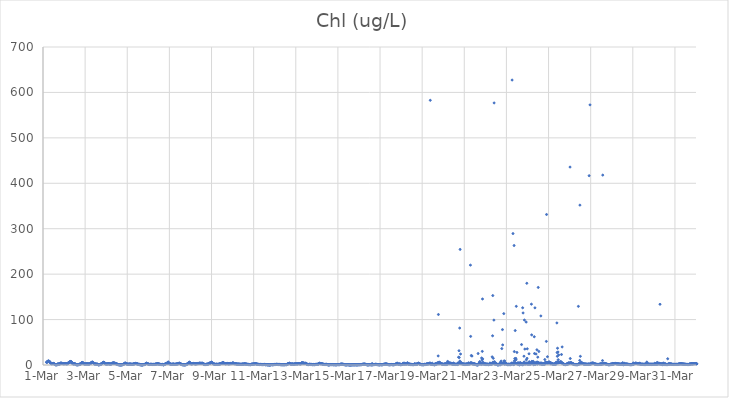
| Category | Chl (ug/L) |
|---|---|
| 44621.166666666664 | 5.81 |
| 44621.177083333336 | 6.24 |
| 44621.1875 | 6.42 |
| 44621.197916666664 | 6.61 |
| 44621.208333333336 | 7.08 |
| 44621.21875 | 6.81 |
| 44621.229166666664 | 7.43 |
| 44621.239583333336 | 8.82 |
| 44621.25 | 8.3 |
| 44621.260416666664 | 8.4 |
| 44621.270833333336 | 8.83 |
| 44621.28125 | 7.63 |
| 44621.291666666664 | 7 |
| 44621.302083333336 | 7.17 |
| 44621.3125 | 7.83 |
| 44621.322916666664 | 6.55 |
| 44621.333333333336 | 5.88 |
| 44621.34375 | 5.48 |
| 44621.354166666664 | 5.16 |
| 44621.364583333336 | 4.21 |
| 44621.375 | 3.6 |
| 44621.385416666664 | 3.33 |
| 44621.395833333336 | 2.93 |
| 44621.40625 | 2.75 |
| 44621.416666666664 | 2.92 |
| 44621.427083333336 | 2.88 |
| 44621.4375 | 2.96 |
| 44621.447916666664 | 3.06 |
| 44621.458333333336 | 2.99 |
| 44621.46875 | 3.15 |
| 44621.479166666664 | 3.33 |
| 44621.489583333336 | 3.61 |
| 44621.5 | 3.28 |
| 44621.510416666664 | 3.13 |
| 44621.520833333336 | 2.56 |
| 44621.53125 | 1.94 |
| 44621.541666666664 | 2.14 |
| 44621.552083333336 | 1.48 |
| 44621.5625 | 1.62 |
| 44621.572916666664 | 1.21 |
| 44621.583333333336 | 0.68 |
| 44621.59375 | 0.63 |
| 44621.604166666664 | 0.73 |
| 44621.614583333336 | 0.49 |
| 44621.625 | 0.66 |
| 44621.635416666664 | 0.61 |
| 44621.645833333336 | 0.64 |
| 44621.65625 | 0.63 |
| 44621.666666666664 | 0.62 |
| 44621.677083333336 | 1.18 |
| 44621.6875 | 0.76 |
| 44621.697916666664 | 1.58 |
| 44621.708333333336 | 2.42 |
| 44621.71875 | 2.84 |
| 44621.729166666664 | 1.41 |
| 44621.739583333336 | 1.57 |
| 44621.75 | 1.59 |
| 44621.760416666664 | 1.9 |
| 44621.770833333336 | 1.86 |
| 44621.78125 | 2.49 |
| 44621.791666666664 | 2.33 |
| 44621.802083333336 | 2.69 |
| 44621.8125 | 3.97 |
| 44621.822916666664 | 3.35 |
| 44621.833333333336 | 2.52 |
| 44621.84375 | 4.01 |
| 44621.854166666664 | 4.46 |
| 44621.864583333336 | 4.21 |
| 44621.875 | 3.61 |
| 44621.885416666664 | 3.43 |
| 44621.895833333336 | 3.08 |
| 44621.90625 | 3.48 |
| 44621.916666666664 | 3.33 |
| 44621.927083333336 | 3.29 |
| 44621.9375 | 3.14 |
| 44621.947916666664 | 2.68 |
| 44621.958333333336 | 2.8 |
| 44621.96875 | 2.78 |
| 44621.979166666664 | 2.89 |
| 44621.989583333336 | 2.97 |
| 44622.0 | 2.79 |
| 44622.010416666664 | 2.92 |
| 44622.020833333336 | 2.85 |
| 44622.03125 | 3.07 |
| 44622.041666666664 | 3.03 |
| 44622.052083333336 | 3.09 |
| 44622.0625 | 3.05 |
| 44622.072916666664 | 3.23 |
| 44622.083333333336 | 3.13 |
| 44622.09375 | 2.34 |
| 44622.104166666664 | 2.75 |
| 44622.114583333336 | 2.76 |
| 44622.125 | 2.82 |
| 44622.135416666664 | 2.78 |
| 44622.145833333336 | 2.82 |
| 44622.15625 | 3.04 |
| 44622.166666666664 | 2.64 |
| 44622.177083333336 | 3.23 |
| 44622.1875 | 4.03 |
| 44622.197916666664 | 4.55 |
| 44622.208333333336 | 4.52 |
| 44622.21875 | 5.01 |
| 44622.229166666664 | 5.44 |
| 44622.239583333336 | 5.59 |
| 44622.25 | 5.75 |
| 44622.260416666664 | 6.1 |
| 44622.270833333336 | 6.4 |
| 44622.28125 | 7.26 |
| 44622.291666666664 | 7.83 |
| 44622.302083333336 | 6.17 |
| 44622.3125 | 7.11 |
| 44622.322916666664 | 7.71 |
| 44622.333333333336 | 6.86 |
| 44622.34375 | 7.07 |
| 44622.354166666664 | 6.28 |
| 44622.364583333336 | 5.53 |
| 44622.375 | 4.74 |
| 44622.385416666664 | 4.25 |
| 44622.395833333336 | 3.78 |
| 44622.40625 | 3.33 |
| 44622.416666666664 | 2.85 |
| 44622.427083333336 | 2.57 |
| 44622.4375 | 2.44 |
| 44622.447916666664 | 2.35 |
| 44622.458333333336 | 2.58 |
| 44622.46875 | 2.59 |
| 44622.479166666664 | 2.75 |
| 44622.489583333336 | 3.01 |
| 44622.5 | 2.68 |
| 44622.510416666664 | 2.52 |
| 44622.520833333336 | 2.45 |
| 44622.53125 | 2.06 |
| 44622.541666666664 | 1.64 |
| 44622.552083333336 | 1.15 |
| 44622.5625 | 0.98 |
| 44622.572916666664 | 1.21 |
| 44622.583333333336 | 0.62 |
| 44622.59375 | 0.6 |
| 44622.604166666664 | 0.79 |
| 44622.614583333336 | 0.69 |
| 44622.625 | 0.46 |
| 44622.635416666664 | 0.48 |
| 44622.645833333336 | 0.63 |
| 44622.65625 | 0.79 |
| 44622.666666666664 | 0.52 |
| 44622.677083333336 | 0.69 |
| 44622.6875 | 1 |
| 44622.697916666664 | 1.22 |
| 44622.708333333336 | 1.14 |
| 44622.71875 | 1.1 |
| 44622.729166666664 | 1.03 |
| 44622.739583333336 | 1.37 |
| 44622.75 | 1.47 |
| 44622.760416666664 | 2.26 |
| 44622.770833333336 | 3.09 |
| 44622.78125 | 1.83 |
| 44622.791666666664 | 1.88 |
| 44622.802083333336 | 2.87 |
| 44622.8125 | 3.79 |
| 44622.822916666664 | 4.49 |
| 44622.833333333336 | 4.03 |
| 44622.84375 | 4.75 |
| 44622.854166666664 | 5.35 |
| 44622.864583333336 | 5.64 |
| 44622.875 | 5.38 |
| 44622.885416666664 | 5.11 |
| 44622.895833333336 | 4.59 |
| 44622.90625 | 4.03 |
| 44622.916666666664 | 3.62 |
| 44622.927083333336 | 3.26 |
| 44622.9375 | 2.79 |
| 44622.947916666664 | 2.58 |
| 44622.958333333336 | 2.47 |
| 44622.96875 | 2.43 |
| 44622.979166666664 | 2.33 |
| 44622.989583333336 | 2.28 |
| 44623.0 | 2.36 |
| 44623.010416666664 | 2.46 |
| 44623.020833333336 | 2.27 |
| 44623.03125 | 2.34 |
| 44623.041666666664 | 2.33 |
| 44623.052083333336 | 2.34 |
| 44623.0625 | 2.4 |
| 44623.072916666664 | 2.49 |
| 44623.083333333336 | 2.42 |
| 44623.09375 | 2.65 |
| 44623.104166666664 | 2.42 |
| 44623.114583333336 | 2.25 |
| 44623.125 | 2.3 |
| 44623.135416666664 | 2.32 |
| 44623.145833333336 | 2.13 |
| 44623.15625 | 2.24 |
| 44623.166666666664 | 2.19 |
| 44623.177083333336 | 2.09 |
| 44623.1875 | 2.29 |
| 44623.197916666664 | 2.48 |
| 44623.208333333336 | 2.39 |
| 44623.21875 | 2.53 |
| 44623.229166666664 | 2.73 |
| 44623.239583333336 | 3.16 |
| 44623.25 | 3.58 |
| 44623.260416666664 | 3.85 |
| 44623.270833333336 | 4.09 |
| 44623.28125 | 4.4 |
| 44623.291666666664 | 4.84 |
| 44623.302083333336 | 5.17 |
| 44623.3125 | 5.11 |
| 44623.322916666664 | 6.08 |
| 44623.333333333336 | 6.38 |
| 44623.34375 | 5.94 |
| 44623.354166666664 | 6.04 |
| 44623.364583333336 | 5.82 |
| 44623.375 | 5.26 |
| 44623.385416666664 | 4.86 |
| 44623.395833333336 | 4.46 |
| 44623.40625 | 4.06 |
| 44623.416666666664 | 3.45 |
| 44623.427083333336 | 3.35 |
| 44623.4375 | 2.81 |
| 44623.447916666664 | 2.37 |
| 44623.458333333336 | 2.04 |
| 44623.46875 | 2.04 |
| 44623.479166666664 | 2.17 |
| 44623.489583333336 | 2.2 |
| 44623.5 | 2.16 |
| 44623.510416666664 | 2.24 |
| 44623.520833333336 | 2.11 |
| 44623.53125 | 1.88 |
| 44623.541666666664 | 1.35 |
| 44623.552083333336 | 1.53 |
| 44623.5625 | 1.77 |
| 44623.572916666664 | 1.83 |
| 44623.583333333336 | 1.76 |
| 44623.59375 | 1.43 |
| 44623.604166666664 | 1.14 |
| 44623.614583333336 | 0.54 |
| 44623.625 | 0.62 |
| 44623.635416666664 | 0.56 |
| 44623.645833333336 | 0.56 |
| 44623.65625 | 0.55 |
| 44623.666666666664 | 0.71 |
| 44623.677083333336 | 0.72 |
| 44623.6875 | 0.89 |
| 44623.697916666664 | 0.82 |
| 44623.708333333336 | 1.09 |
| 44623.71875 | 1.02 |
| 44623.729166666664 | 1.81 |
| 44623.739583333336 | 1.55 |
| 44623.75 | 1.52 |
| 44623.760416666664 | 2.25 |
| 44623.770833333336 | 2.27 |
| 44623.78125 | 2.52 |
| 44623.791666666664 | 3.14 |
| 44623.802083333336 | 3.49 |
| 44623.8125 | 3.98 |
| 44623.822916666664 | 4.35 |
| 44623.833333333336 | 4.85 |
| 44623.84375 | 4.59 |
| 44623.854166666664 | 4.9 |
| 44623.864583333336 | 5 |
| 44623.875 | 5.66 |
| 44623.885416666664 | 6.25 |
| 44623.895833333336 | 5.83 |
| 44623.90625 | 5.19 |
| 44623.916666666664 | 4.59 |
| 44623.927083333336 | 4.33 |
| 44623.9375 | 3.58 |
| 44623.947916666664 | 3.2 |
| 44623.958333333336 | 3.14 |
| 44623.96875 | 2.48 |
| 44623.979166666664 | 2.46 |
| 44623.989583333336 | 2.35 |
| 44624.0 | 2.19 |
| 44624.010416666664 | 2.34 |
| 44624.020833333336 | 2.21 |
| 44624.03125 | 2.2 |
| 44624.041666666664 | 2.26 |
| 44624.052083333336 | 2.44 |
| 44624.0625 | 2.36 |
| 44624.072916666664 | 2.7 |
| 44624.083333333336 | 2.73 |
| 44624.09375 | 2.67 |
| 44624.104166666664 | 2.78 |
| 44624.114583333336 | 2.67 |
| 44624.125 | 2.64 |
| 44624.135416666664 | 2.63 |
| 44624.145833333336 | 2.43 |
| 44624.15625 | 2.37 |
| 44624.166666666664 | 2.16 |
| 44624.177083333336 | 2.09 |
| 44624.1875 | 2.18 |
| 44624.197916666664 | 2.15 |
| 44624.208333333336 | 2.1 |
| 44624.21875 | 2.17 |
| 44624.229166666664 | 1.98 |
| 44624.239583333336 | 2.2 |
| 44624.25 | 2.61 |
| 44624.260416666664 | 3.22 |
| 44624.270833333336 | 3.53 |
| 44624.28125 | 4.03 |
| 44624.291666666664 | 3.77 |
| 44624.302083333336 | 4.04 |
| 44624.3125 | 4.15 |
| 44624.322916666664 | 4.02 |
| 44624.333333333336 | 4.15 |
| 44624.34375 | 3.89 |
| 44624.354166666664 | 4.82 |
| 44624.364583333336 | 4.69 |
| 44624.375 | 4.1 |
| 44624.385416666664 | 4.14 |
| 44624.395833333336 | 3.59 |
| 44624.40625 | 3.84 |
| 44624.416666666664 | 3.69 |
| 44624.427083333336 | 3.7 |
| 44624.4375 | 3.42 |
| 44624.447916666664 | 3.02 |
| 44624.458333333336 | 2.74 |
| 44624.46875 | 2.54 |
| 44624.479166666664 | 2.6 |
| 44624.489583333336 | 2.45 |
| 44624.5 | 2.46 |
| 44624.510416666664 | 2 |
| 44624.520833333336 | 2.02 |
| 44624.53125 | 1.47 |
| 44624.541666666664 | 1.03 |
| 44624.552083333336 | 0.97 |
| 44624.5625 | 0.92 |
| 44624.572916666664 | 0.81 |
| 44624.583333333336 | 0.79 |
| 44624.59375 | 0.68 |
| 44624.604166666664 | 0.7 |
| 44624.614583333336 | 0.55 |
| 44624.625 | 0.43 |
| 44624.635416666664 | 0.52 |
| 44624.645833333336 | 0.65 |
| 44624.65625 | 0.4 |
| 44624.666666666664 | 0.37 |
| 44624.677083333336 | 0.44 |
| 44624.6875 | 0.42 |
| 44624.697916666664 | 0.3 |
| 44624.708333333336 | 0.35 |
| 44624.71875 | 0.27 |
| 44624.729166666664 | 0.48 |
| 44624.739583333336 | 0.75 |
| 44624.75 | 0.72 |
| 44624.760416666664 | 0.88 |
| 44624.770833333336 | 0.67 |
| 44624.78125 | 0.69 |
| 44624.791666666664 | 1.04 |
| 44624.802083333336 | 1.13 |
| 44624.8125 | 1.26 |
| 44624.822916666664 | 1.76 |
| 44624.833333333336 | 1.79 |
| 44624.84375 | 2 |
| 44624.854166666664 | 2.44 |
| 44624.864583333336 | 2.82 |
| 44624.875 | 3.76 |
| 44624.885416666664 | 3.87 |
| 44624.895833333336 | 3.85 |
| 44624.90625 | 3.91 |
| 44624.916666666664 | 3.95 |
| 44624.927083333336 | 3.74 |
| 44624.9375 | 3.51 |
| 44624.947916666664 | 3.38 |
| 44624.958333333336 | 2.75 |
| 44624.96875 | 2.42 |
| 44624.979166666664 | 2.34 |
| 44624.989583333336 | 2.21 |
| 44625.0 | 1.98 |
| 44625.010416666664 | 1.67 |
| 44625.020833333336 | 1.71 |
| 44625.03125 | 1.51 |
| 44625.041666666664 | 1.43 |
| 44625.052083333336 | 1.71 |
| 44625.0625 | 1.72 |
| 44625.072916666664 | 1.66 |
| 44625.083333333336 | 1.94 |
| 44625.09375 | 1.74 |
| 44625.104166666664 | 1.99 |
| 44625.114583333336 | 1.89 |
| 44625.125 | 2.24 |
| 44625.135416666664 | 1.87 |
| 44625.145833333336 | 1.87 |
| 44625.15625 | 1.98 |
| 44625.166666666664 | 1.7 |
| 44625.177083333336 | 1.65 |
| 44625.1875 | 1.62 |
| 44625.197916666664 | 1.6 |
| 44625.208333333336 | 1.59 |
| 44625.21875 | 1.54 |
| 44625.229166666664 | 1.42 |
| 44625.239583333336 | 1.35 |
| 44625.25 | 1.47 |
| 44625.260416666664 | 1.58 |
| 44625.270833333336 | 1.88 |
| 44625.28125 | 1.96 |
| 44625.291666666664 | 2.15 |
| 44625.302083333336 | 2.35 |
| 44625.3125 | 2.33 |
| 44625.322916666664 | 2.52 |
| 44625.333333333336 | 2.75 |
| 44625.34375 | 2.8 |
| 44625.354166666664 | 2.53 |
| 44625.364583333336 | 2.89 |
| 44625.375 | 3.19 |
| 44625.385416666664 | 3.59 |
| 44625.395833333336 | 3.22 |
| 44625.40625 | 3.52 |
| 44625.416666666664 | 3.09 |
| 44625.427083333336 | 3.26 |
| 44625.4375 | 2.93 |
| 44625.447916666664 | 2.95 |
| 44625.458333333336 | 2.59 |
| 44625.46875 | 2.47 |
| 44625.479166666664 | 2.32 |
| 44625.489583333336 | 2.27 |
| 44625.5 | 1.9 |
| 44625.510416666664 | 1.7 |
| 44625.520833333336 | 1.57 |
| 44625.53125 | 1.42 |
| 44625.541666666664 | 1.37 |
| 44625.552083333336 | 1.33 |
| 44625.5625 | 1.3 |
| 44625.572916666664 | 1.44 |
| 44625.583333333336 | 1.35 |
| 44625.59375 | 0.72 |
| 44625.604166666664 | 0.47 |
| 44625.614583333336 | 0.56 |
| 44625.625 | 0.58 |
| 44625.635416666664 | 0.71 |
| 44625.645833333336 | 1.03 |
| 44625.65625 | 0.49 |
| 44625.666666666664 | 0.41 |
| 44625.677083333336 | 0.46 |
| 44625.6875 | 0.35 |
| 44625.697916666664 | 0.31 |
| 44625.708333333336 | 0.34 |
| 44625.71875 | 0.3 |
| 44625.729166666664 | 0.42 |
| 44625.739583333336 | 0.48 |
| 44625.75 | 0.79 |
| 44625.760416666664 | 0.74 |
| 44625.770833333336 | 0.85 |
| 44625.78125 | 0.88 |
| 44625.791666666664 | 0.93 |
| 44625.802083333336 | 0.79 |
| 44625.8125 | 0.97 |
| 44625.822916666664 | 1.09 |
| 44625.833333333336 | 1.21 |
| 44625.84375 | 1.66 |
| 44625.854166666664 | 2.05 |
| 44625.864583333336 | 2.64 |
| 44625.875 | 2.29 |
| 44625.885416666664 | 2.74 |
| 44625.895833333336 | 3.21 |
| 44625.90625 | 4.07 |
| 44625.916666666664 | 3.71 |
| 44625.927083333336 | 3.61 |
| 44625.9375 | 3.37 |
| 44625.947916666664 | 2.98 |
| 44625.958333333336 | 3.07 |
| 44625.96875 | 2.9 |
| 44625.979166666664 | 2.57 |
| 44625.989583333336 | 2.2 |
| 44626.0 | 1.88 |
| 44626.010416666664 | 1.59 |
| 44626.020833333336 | 1.52 |
| 44626.03125 | 1.37 |
| 44626.041666666664 | 1.24 |
| 44626.052083333336 | 1.22 |
| 44626.0625 | 1.11 |
| 44626.072916666664 | 1.35 |
| 44626.083333333336 | 1.43 |
| 44626.09375 | 1.47 |
| 44626.104166666664 | 1.42 |
| 44626.114583333336 | 1.43 |
| 44626.125 | 1.48 |
| 44626.135416666664 | 1.38 |
| 44626.145833333336 | 1.35 |
| 44626.15625 | 1.48 |
| 44626.166666666664 | 1.41 |
| 44626.177083333336 | 1.26 |
| 44626.1875 | 1.23 |
| 44626.197916666664 | 1.16 |
| 44626.208333333336 | 1.26 |
| 44626.21875 | 1.2 |
| 44626.229166666664 | 1.46 |
| 44626.239583333336 | 1.31 |
| 44626.25 | 1.25 |
| 44626.260416666664 | 1.21 |
| 44626.270833333336 | 1.23 |
| 44626.28125 | 1.17 |
| 44626.291666666664 | 1.21 |
| 44626.302083333336 | 1.24 |
| 44626.3125 | 1.58 |
| 44626.322916666664 | 1.63 |
| 44626.333333333336 | 1.7 |
| 44626.34375 | 1.84 |
| 44626.354166666664 | 1.88 |
| 44626.364583333336 | 2.03 |
| 44626.375 | 2.02 |
| 44626.385416666664 | 2.23 |
| 44626.395833333336 | 2.3 |
| 44626.40625 | 2.21 |
| 44626.416666666664 | 2.49 |
| 44626.427083333336 | 2.57 |
| 44626.4375 | 2.99 |
| 44626.447916666664 | 2.57 |
| 44626.458333333336 | 2.54 |
| 44626.46875 | 2.39 |
| 44626.479166666664 | 2.47 |
| 44626.489583333336 | 2.15 |
| 44626.5 | 2.05 |
| 44626.510416666664 | 1.82 |
| 44626.520833333336 | 1.74 |
| 44626.53125 | 1.77 |
| 44626.541666666664 | 1.57 |
| 44626.552083333336 | 1.39 |
| 44626.5625 | 1.22 |
| 44626.572916666664 | 1.24 |
| 44626.583333333336 | 1.2 |
| 44626.59375 | 1.14 |
| 44626.604166666664 | 0.93 |
| 44626.614583333336 | 1.05 |
| 44626.625 | 1.07 |
| 44626.635416666664 | 1.13 |
| 44626.645833333336 | 0.69 |
| 44626.65625 | 1.02 |
| 44626.666666666664 | 0.93 |
| 44626.677083333336 | 1.46 |
| 44626.6875 | 1.1 |
| 44626.697916666664 | 0.83 |
| 44626.708333333336 | 0.5 |
| 44626.71875 | 0.43 |
| 44626.729166666664 | 0.63 |
| 44626.739583333336 | 0.79 |
| 44626.75 | 1.14 |
| 44626.760416666664 | 1.2 |
| 44626.770833333336 | 1.07 |
| 44626.78125 | 1.06 |
| 44626.791666666664 | 1.74 |
| 44626.802083333336 | 2.44 |
| 44626.8125 | 2.74 |
| 44626.822916666664 | 3.04 |
| 44626.833333333336 | 3.14 |
| 44626.84375 | 3.13 |
| 44626.854166666664 | 3.09 |
| 44626.864583333336 | 3.54 |
| 44626.875 | 3.57 |
| 44626.885416666664 | 3.85 |
| 44626.895833333336 | 4.06 |
| 44626.90625 | 3.91 |
| 44626.916666666664 | 4.82 |
| 44626.927083333336 | 5.33 |
| 44626.9375 | 4.83 |
| 44626.947916666664 | 6.79 |
| 44626.958333333336 | 4.81 |
| 44626.96875 | 4.07 |
| 44626.979166666664 | 3.83 |
| 44626.989583333336 | 3.66 |
| 44627.0 | 3.49 |
| 44627.010416666664 | 3.05 |
| 44627.020833333336 | 2.44 |
| 44627.03125 | 2.26 |
| 44627.041666666664 | 2.17 |
| 44627.052083333336 | 1.93 |
| 44627.0625 | 1.73 |
| 44627.072916666664 | 1.51 |
| 44627.083333333336 | 1.58 |
| 44627.09375 | 1.35 |
| 44627.104166666664 | 1.55 |
| 44627.114583333336 | 1.54 |
| 44627.125 | 1.49 |
| 44627.135416666664 | 1.6 |
| 44627.145833333336 | 1.65 |
| 44627.15625 | 1.79 |
| 44627.166666666664 | 1.9 |
| 44627.177083333336 | 1.98 |
| 44627.1875 | 1.84 |
| 44627.197916666664 | 2.05 |
| 44627.208333333336 | 1.82 |
| 44627.21875 | 1.7 |
| 44627.229166666664 | 1.4 |
| 44627.239583333336 | 1.35 |
| 44627.25 | 1.45 |
| 44627.260416666664 | 1.64 |
| 44627.270833333336 | 1.58 |
| 44627.28125 | 1.56 |
| 44627.291666666664 | 1.5 |
| 44627.302083333336 | 1.68 |
| 44627.3125 | 1.79 |
| 44627.322916666664 | 1.96 |
| 44627.333333333336 | 2.13 |
| 44627.34375 | 2.2 |
| 44627.354166666664 | 2.29 |
| 44627.364583333336 | 2.27 |
| 44627.375 | 2.33 |
| 44627.385416666664 | 2.31 |
| 44627.395833333336 | 2.58 |
| 44627.40625 | 2.5 |
| 44627.416666666664 | 3 |
| 44627.427083333336 | 2.89 |
| 44627.4375 | 3.13 |
| 44627.447916666664 | 3.36 |
| 44627.458333333336 | 3.48 |
| 44627.46875 | 4.36 |
| 44627.479166666664 | 3.59 |
| 44627.489583333336 | 3.2 |
| 44627.5 | 2.96 |
| 44627.510416666664 | 2.71 |
| 44627.520833333336 | 2.68 |
| 44627.53125 | 2.65 |
| 44627.541666666664 | 2.22 |
| 44627.552083333336 | 2 |
| 44627.5625 | 1.39 |
| 44627.572916666664 | 1.59 |
| 44627.583333333336 | 1.02 |
| 44627.59375 | 0.86 |
| 44627.604166666664 | 0.67 |
| 44627.614583333336 | 0.67 |
| 44627.625 | 0.81 |
| 44627.635416666664 | 0.68 |
| 44627.645833333336 | 0.55 |
| 44627.65625 | 0.73 |
| 44627.666666666664 | 0.64 |
| 44627.677083333336 | 0.41 |
| 44627.6875 | 0.49 |
| 44627.697916666664 | 0.4 |
| 44627.708333333336 | 0.39 |
| 44627.71875 | 0.39 |
| 44627.729166666664 | 0.46 |
| 44627.739583333336 | 0.85 |
| 44627.75 | 0.59 |
| 44627.760416666664 | 0.4 |
| 44627.770833333336 | 0.71 |
| 44627.78125 | 0.66 |
| 44627.791666666664 | 0.98 |
| 44627.802083333336 | 1.36 |
| 44627.8125 | 0.92 |
| 44627.822916666664 | 1.28 |
| 44627.833333333336 | 1.48 |
| 44627.84375 | 2.01 |
| 44627.854166666664 | 2.52 |
| 44627.864583333336 | 3.11 |
| 44627.875 | 3.51 |
| 44627.885416666664 | 3.87 |
| 44627.895833333336 | 3.95 |
| 44627.90625 | 4.07 |
| 44627.916666666664 | 4.31 |
| 44627.927083333336 | 4.61 |
| 44627.9375 | 4.64 |
| 44627.947916666664 | 6.43 |
| 44627.958333333336 | 5.17 |
| 44627.96875 | 5.81 |
| 44627.979166666664 | 4.61 |
| 44627.989583333336 | 3.34 |
| 44628.0 | 2.92 |
| 44628.010416666664 | 3.1 |
| 44628.020833333336 | 3.05 |
| 44628.03125 | 2.51 |
| 44628.041666666664 | 2.33 |
| 44628.052083333336 | 2.38 |
| 44628.0625 | 2.64 |
| 44628.072916666664 | 3.03 |
| 44628.083333333336 | 2.94 |
| 44628.09375 | 2.58 |
| 44628.104166666664 | 2.85 |
| 44628.114583333336 | 2.97 |
| 44628.125 | 3.4 |
| 44628.135416666664 | 3.34 |
| 44628.145833333336 | 3.4 |
| 44628.15625 | 3.2 |
| 44628.166666666664 | 2.97 |
| 44628.177083333336 | 2.89 |
| 44628.1875 | 2.74 |
| 44628.197916666664 | 2.87 |
| 44628.208333333336 | 3.12 |
| 44628.21875 | 2.84 |
| 44628.229166666664 | 2.34 |
| 44628.239583333336 | 2.45 |
| 44628.25 | 2.44 |
| 44628.260416666664 | 2.38 |
| 44628.270833333336 | 2.39 |
| 44628.28125 | 2.76 |
| 44628.291666666664 | 2.9 |
| 44628.302083333336 | 3.18 |
| 44628.3125 | 3.12 |
| 44628.322916666664 | 3.36 |
| 44628.333333333336 | 3 |
| 44628.34375 | 2.93 |
| 44628.354166666664 | 3.1 |
| 44628.364583333336 | 3.01 |
| 44628.375 | 3.23 |
| 44628.385416666664 | 3.39 |
| 44628.395833333336 | 3.47 |
| 44628.40625 | 3.59 |
| 44628.416666666664 | 3.53 |
| 44628.427083333336 | 3.57 |
| 44628.4375 | 4.02 |
| 44628.447916666664 | 4.1 |
| 44628.458333333336 | 3.76 |
| 44628.46875 | 3.66 |
| 44628.479166666664 | 3.55 |
| 44628.489583333336 | 3.54 |
| 44628.5 | 3.49 |
| 44628.510416666664 | 3.39 |
| 44628.520833333336 | 3.67 |
| 44628.53125 | 3.53 |
| 44628.541666666664 | 3.66 |
| 44628.552083333336 | 3.96 |
| 44628.5625 | 3.85 |
| 44628.572916666664 | 3.54 |
| 44628.583333333336 | 3.28 |
| 44628.59375 | 2.77 |
| 44628.604166666664 | 2.77 |
| 44628.614583333336 | 2.45 |
| 44628.625 | 1.69 |
| 44628.635416666664 | 1.89 |
| 44628.645833333336 | 1.33 |
| 44628.65625 | 1.85 |
| 44628.666666666664 | 1.33 |
| 44628.677083333336 | 1.1 |
| 44628.6875 | 0.89 |
| 44628.697916666664 | 1.37 |
| 44628.708333333336 | 0.97 |
| 44628.71875 | 1.16 |
| 44628.729166666664 | 0.98 |
| 44628.739583333336 | 1.24 |
| 44628.75 | 1.12 |
| 44628.760416666664 | 1.84 |
| 44628.770833333336 | 1.39 |
| 44628.78125 | 1.64 |
| 44628.791666666664 | 1.53 |
| 44628.802083333336 | 1.65 |
| 44628.8125 | 1.69 |
| 44628.822916666664 | 1.73 |
| 44628.833333333336 | 2.04 |
| 44628.84375 | 2.12 |
| 44628.854166666664 | 2.49 |
| 44628.864583333336 | 3.18 |
| 44628.875 | 3.64 |
| 44628.885416666664 | 3.78 |
| 44628.895833333336 | 3.86 |
| 44628.90625 | 3.74 |
| 44628.916666666664 | 4.04 |
| 44628.927083333336 | 3.98 |
| 44628.9375 | 4.05 |
| 44628.947916666664 | 4.23 |
| 44628.958333333336 | 4.62 |
| 44628.96875 | 4.58 |
| 44628.979166666664 | 5.04 |
| 44628.989583333336 | 5.96 |
| 44629.0 | 6.17 |
| 44629.010416666664 | 5.56 |
| 44629.020833333336 | 5.34 |
| 44629.03125 | 5.49 |
| 44629.041666666664 | 4.76 |
| 44629.052083333336 | 3.86 |
| 44629.0625 | 3.14 |
| 44629.072916666664 | 3.42 |
| 44629.083333333336 | 2.97 |
| 44629.09375 | 2.74 |
| 44629.104166666664 | 2.41 |
| 44629.114583333336 | 2.2 |
| 44629.125 | 2.18 |
| 44629.135416666664 | 1.84 |
| 44629.145833333336 | 1.68 |
| 44629.15625 | 1.46 |
| 44629.166666666664 | 1.41 |
| 44629.177083333336 | 1.31 |
| 44629.1875 | 1.41 |
| 44629.197916666664 | 1.38 |
| 44629.208333333336 | 1.22 |
| 44629.21875 | 1.35 |
| 44629.229166666664 | 1.48 |
| 44629.239583333336 | 1.53 |
| 44629.25 | 1.76 |
| 44629.260416666664 | 1.72 |
| 44629.270833333336 | 1.37 |
| 44629.28125 | 1.38 |
| 44629.291666666664 | 1.34 |
| 44629.302083333336 | 1.17 |
| 44629.3125 | 1.49 |
| 44629.322916666664 | 1.25 |
| 44629.333333333336 | 1.43 |
| 44629.34375 | 1.58 |
| 44629.354166666664 | 1.95 |
| 44629.364583333336 | 2.16 |
| 44629.375 | 2.2 |
| 44629.385416666664 | 2.33 |
| 44629.395833333336 | 2.26 |
| 44629.40625 | 2.42 |
| 44629.416666666664 | 2.62 |
| 44629.427083333336 | 2.82 |
| 44629.4375 | 3.04 |
| 44629.447916666664 | 3.14 |
| 44629.458333333336 | 3.49 |
| 44629.46875 | 3.57 |
| 44629.479166666664 | 3.81 |
| 44629.489583333336 | 3.57 |
| 44629.5 | 3.82 |
| 44629.510416666664 | 4.12 |
| 44629.520833333336 | 4.18 |
| 44629.53125 | 4.33 |
| 44629.541666666664 | 5.57 |
| 44629.552083333336 | 5.23 |
| 44629.5625 | 4.61 |
| 44629.572916666664 | 4.58 |
| 44629.583333333336 | 3.94 |
| 44629.59375 | 3.67 |
| 44629.604166666664 | 3.63 |
| 44629.614583333336 | 3.54 |
| 44629.625 | 3.2 |
| 44629.635416666664 | 3.14 |
| 44629.645833333336 | 2.87 |
| 44629.65625 | 3.01 |
| 44629.666666666664 | 2.72 |
| 44629.677083333336 | 2.54 |
| 44629.6875 | 2.69 |
| 44629.697916666664 | 2.82 |
| 44629.708333333336 | 3.12 |
| 44629.71875 | 3.21 |
| 44629.729166666664 | 3.14 |
| 44629.739583333336 | 3.23 |
| 44629.75 | 2.87 |
| 44629.760416666664 | 3.44 |
| 44629.770833333336 | 3.22 |
| 44629.78125 | 2.53 |
| 44629.791666666664 | 2.65 |
| 44629.802083333336 | 2.85 |
| 44629.8125 | 2.57 |
| 44629.822916666664 | 2.75 |
| 44629.833333333336 | 2.62 |
| 44629.84375 | 3.13 |
| 44629.854166666664 | 2.81 |
| 44629.864583333336 | 2.71 |
| 44629.875 | 2.71 |
| 44629.885416666664 | 2.82 |
| 44629.895833333336 | 3.5 |
| 44629.90625 | 2.95 |
| 44629.916666666664 | 3.32 |
| 44629.927083333336 | 3.05 |
| 44629.9375 | 3.04 |
| 44629.947916666664 | 3.27 |
| 44629.958333333336 | 3.12 |
| 44629.96875 | 3.59 |
| 44629.979166666664 | 3.98 |
| 44629.989583333336 | 3.85 |
| 44630.0 | 4.35 |
| 44630.010416666664 | 4.01 |
| 44630.020833333336 | 4.14 |
| 44630.03125 | 4.23 |
| 44630.041666666664 | 4.19 |
| 44630.052083333336 | 3.29 |
| 44630.0625 | 3.78 |
| 44630.072916666664 | 3.18 |
| 44630.083333333336 | 3.27 |
| 44630.09375 | 2.76 |
| 44630.104166666664 | 2.83 |
| 44630.114583333336 | 2.85 |
| 44630.125 | 3.03 |
| 44630.135416666664 | 2.93 |
| 44630.145833333336 | 2.71 |
| 44630.15625 | 2.76 |
| 44630.166666666664 | 2.6 |
| 44630.177083333336 | 2.33 |
| 44630.1875 | 2.42 |
| 44630.197916666664 | 2.05 |
| 44630.208333333336 | 1.83 |
| 44630.21875 | 1.84 |
| 44630.229166666664 | 1.93 |
| 44630.239583333336 | 1.85 |
| 44630.25 | 1.91 |
| 44630.260416666664 | 1.84 |
| 44630.270833333336 | 1.72 |
| 44630.28125 | 1.94 |
| 44630.291666666664 | 1.86 |
| 44630.302083333336 | 1.83 |
| 44630.3125 | 1.76 |
| 44630.322916666664 | 1.7 |
| 44630.333333333336 | 1.6 |
| 44630.34375 | 1.7 |
| 44630.354166666664 | 1.55 |
| 44630.364583333336 | 1.54 |
| 44630.375 | 1.48 |
| 44630.385416666664 | 1.52 |
| 44630.395833333336 | 1.45 |
| 44630.40625 | 1.34 |
| 44630.416666666664 | 1.44 |
| 44630.427083333336 | 1.55 |
| 44630.4375 | 1.6 |
| 44630.447916666664 | 1.68 |
| 44630.458333333336 | 2 |
| 44630.46875 | 2.05 |
| 44630.479166666664 | 1.97 |
| 44630.489583333336 | 1.71 |
| 44630.5 | 1.86 |
| 44630.510416666664 | 1.85 |
| 44630.520833333336 | 1.84 |
| 44630.53125 | 1.94 |
| 44630.541666666664 | 2.15 |
| 44630.552083333336 | 2.33 |
| 44630.5625 | 2.57 |
| 44630.572916666664 | 2.82 |
| 44630.583333333336 | 2.55 |
| 44630.59375 | 2.33 |
| 44630.604166666664 | 2.16 |
| 44630.614583333336 | 2.09 |
| 44630.625 | 2.08 |
| 44630.635416666664 | 1.89 |
| 44630.645833333336 | 1.99 |
| 44630.65625 | 1.83 |
| 44630.666666666664 | 1.8 |
| 44630.677083333336 | 1.64 |
| 44630.6875 | 1.58 |
| 44630.697916666664 | 1.3 |
| 44630.708333333336 | 1.34 |
| 44630.71875 | 1.51 |
| 44630.729166666664 | 1.57 |
| 44630.739583333336 | 1.44 |
| 44630.75 | 1.45 |
| 44630.760416666664 | 1 |
| 44630.770833333336 | 0.73 |
| 44630.78125 | 0.75 |
| 44630.791666666664 | 0.88 |
| 44630.802083333336 | 1.04 |
| 44630.8125 | 1.1 |
| 44630.822916666664 | 0.93 |
| 44630.833333333336 | 0.96 |
| 44630.84375 | 0.62 |
| 44630.854166666664 | 1.08 |
| 44630.864583333336 | 0.91 |
| 44630.875 | 1.43 |
| 44630.885416666664 | 1.48 |
| 44630.895833333336 | 1.75 |
| 44630.90625 | 1.52 |
| 44630.916666666664 | 1.65 |
| 44630.927083333336 | 1.78 |
| 44630.9375 | 1.82 |
| 44630.947916666664 | 1.85 |
| 44630.958333333336 | 1.98 |
| 44630.96875 | 1.95 |
| 44630.979166666664 | 2.04 |
| 44630.989583333336 | 2.28 |
| 44631.0 | 2.15 |
| 44631.010416666664 | 2.14 |
| 44631.020833333336 | 2.24 |
| 44631.03125 | 2.4 |
| 44631.041666666664 | 2.47 |
| 44631.052083333336 | 2.61 |
| 44631.0625 | 2.69 |
| 44631.072916666664 | 3.09 |
| 44631.083333333336 | 2.95 |
| 44631.09375 | 2.78 |
| 44631.104166666664 | 2.92 |
| 44631.114583333336 | 2.6 |
| 44631.125 | 2.25 |
| 44631.135416666664 | 2.15 |
| 44631.145833333336 | 2.03 |
| 44631.15625 | 1.92 |
| 44631.166666666664 | 1.55 |
| 44631.177083333336 | 1.55 |
| 44631.1875 | 1.69 |
| 44631.197916666664 | 1.65 |
| 44631.208333333336 | 1.45 |
| 44631.21875 | 1.41 |
| 44631.229166666664 | 1.37 |
| 44631.239583333336 | 1.29 |
| 44631.25 | 1.33 |
| 44631.260416666664 | 1.26 |
| 44631.270833333336 | 1.16 |
| 44631.28125 | 1 |
| 44631.291666666664 | 1.15 |
| 44631.302083333336 | 1.19 |
| 44631.3125 | 1.31 |
| 44631.322916666664 | 1.26 |
| 44631.333333333336 | 1.22 |
| 44631.34375 | 1.13 |
| 44631.354166666664 | 1.02 |
| 44631.364583333336 | 0.99 |
| 44631.375 | 1.13 |
| 44631.385416666664 | 1.01 |
| 44631.395833333336 | 1.06 |
| 44631.40625 | 1.07 |
| 44631.416666666664 | 0.95 |
| 44631.427083333336 | 0.9 |
| 44631.4375 | 0.99 |
| 44631.447916666664 | 0.88 |
| 44631.458333333336 | 0.99 |
| 44631.46875 | 1.06 |
| 44631.479166666664 | 0.99 |
| 44631.489583333336 | 1.18 |
| 44631.5 | 1.29 |
| 44631.510416666664 | 1.27 |
| 44631.520833333336 | 1.08 |
| 44631.53125 | 1.23 |
| 44631.541666666664 | 1.18 |
| 44631.552083333336 | 0.99 |
| 44631.5625 | 0.64 |
| 44631.572916666664 | 0.64 |
| 44631.583333333336 | 0.97 |
| 44631.59375 | 0.79 |
| 44631.604166666664 | 0.78 |
| 44631.614583333336 | 0.85 |
| 44631.625 | 0.88 |
| 44631.635416666664 | 0.73 |
| 44631.645833333336 | 0.58 |
| 44631.65625 | 0.48 |
| 44631.666666666664 | 0.33 |
| 44631.677083333336 | 0.68 |
| 44631.6875 | 0.7 |
| 44631.697916666664 | 0.45 |
| 44631.708333333336 | 0.4 |
| 44631.71875 | 0.4 |
| 44631.729166666664 | 0.38 |
| 44631.739583333336 | 0.32 |
| 44631.75 | 0.18 |
| 44631.760416666664 | 0.18 |
| 44631.770833333336 | 0.23 |
| 44631.78125 | 0.36 |
| 44631.791666666664 | 0.41 |
| 44631.802083333336 | 0.55 |
| 44631.8125 | 0.47 |
| 44631.822916666664 | 0.74 |
| 44631.833333333336 | 0.78 |
| 44631.84375 | 0.96 |
| 44631.854166666664 | 0.86 |
| 44631.864583333336 | 0.67 |
| 44631.875 | 0.72 |
| 44631.885416666664 | 0.55 |
| 44631.895833333336 | 0.74 |
| 44631.90625 | 0.73 |
| 44631.916666666664 | 0.89 |
| 44631.927083333336 | 0.88 |
| 44631.9375 | 0.82 |
| 44631.947916666664 | 0.88 |
| 44631.958333333336 | 0.99 |
| 44631.96875 | 1.15 |
| 44631.979166666664 | 1.15 |
| 44631.989583333336 | 1.17 |
| 44632.0 | 1.02 |
| 44632.010416666664 | 1.03 |
| 44632.020833333336 | 0.94 |
| 44632.03125 | 1.13 |
| 44632.041666666664 | 1.13 |
| 44632.052083333336 | 1.35 |
| 44632.0625 | 1.3 |
| 44632.072916666664 | 1.41 |
| 44632.083333333336 | 1.3 |
| 44632.09375 | 1.45 |
| 44632.104166666664 | 1.49 |
| 44632.114583333336 | 1.31 |
| 44632.125 | 1.35 |
| 44632.135416666664 | 1.18 |
| 44632.145833333336 | 1.29 |
| 44632.15625 | 1.34 |
| 44632.166666666664 | 1.21 |
| 44632.177083333336 | 1.23 |
| 44632.1875 | 1.03 |
| 44632.197916666664 | 1.01 |
| 44632.208333333336 | 1.22 |
| 44632.21875 | 1.2 |
| 44632.229166666664 | 1.17 |
| 44632.239583333336 | 1.07 |
| 44632.25 | 1.19 |
| 44632.260416666664 | 0.89 |
| 44632.270833333336 | 0.85 |
| 44632.28125 | 0.84 |
| 44632.291666666664 | 1 |
| 44632.302083333336 | 0.76 |
| 44632.3125 | 0.73 |
| 44632.322916666664 | 0.73 |
| 44632.333333333336 | 0.82 |
| 44632.34375 | 0.74 |
| 44632.354166666664 | 0.67 |
| 44632.364583333336 | 0.81 |
| 44632.375 | 0.67 |
| 44632.385416666664 | 0.7 |
| 44632.395833333336 | 0.86 |
| 44632.40625 | 0.68 |
| 44632.416666666664 | 0.84 |
| 44632.427083333336 | 0.68 |
| 44632.4375 | 0.62 |
| 44632.447916666664 | 0.68 |
| 44632.458333333336 | 0.65 |
| 44632.46875 | 0.72 |
| 44632.479166666664 | 0.91 |
| 44632.489583333336 | 0.84 |
| 44632.5 | 0.85 |
| 44632.510416666664 | 0.9 |
| 44632.520833333336 | 0.9 |
| 44632.53125 | 0.85 |
| 44632.541666666664 | 0.71 |
| 44632.552083333336 | 0.83 |
| 44632.5625 | 0.92 |
| 44632.572916666664 | 0.81 |
| 44632.583333333336 | 1.65 |
| 44632.59375 | 1.82 |
| 44632.604166666664 | 2.04 |
| 44632.614583333336 | 2.15 |
| 44632.625 | 2.31 |
| 44632.635416666664 | 2.42 |
| 44632.645833333336 | 2.97 |
| 44632.65625 | 2.96 |
| 44632.666666666664 | 2.96 |
| 44632.677083333336 | 3.32 |
| 44632.6875 | 3.39 |
| 44632.697916666664 | 3.69 |
| 44632.708333333336 | 3.77 |
| 44632.71875 | 3.7 |
| 44632.729166666664 | 2.42 |
| 44632.739583333336 | 2.53 |
| 44632.75 | 2.23 |
| 44632.760416666664 | 2.27 |
| 44632.770833333336 | 2.51 |
| 44632.78125 | 1.75 |
| 44632.791666666664 | 1.71 |
| 44632.802083333336 | 1.63 |
| 44632.8125 | 2.17 |
| 44632.822916666664 | 2.34 |
| 44632.833333333336 | 2.26 |
| 44632.84375 | 2.29 |
| 44632.854166666664 | 2.07 |
| 44632.864583333336 | 2.01 |
| 44632.875 | 1.88 |
| 44632.885416666664 | 1.52 |
| 44632.895833333336 | 1.55 |
| 44632.90625 | 1.74 |
| 44632.916666666664 | 1.61 |
| 44632.927083333336 | 2.05 |
| 44632.9375 | 1.99 |
| 44632.947916666664 | 2.71 |
| 44632.958333333336 | 2.14 |
| 44632.96875 | 1.95 |
| 44632.979166666664 | 2.3 |
| 44632.989583333336 | 2.42 |
| 44633.0 | 2.57 |
| 44633.010416666664 | 2.61 |
| 44633.020833333336 | 2.84 |
| 44633.03125 | 2.43 |
| 44633.041666666664 | 2.42 |
| 44633.052083333336 | 2.56 |
| 44633.0625 | 2.39 |
| 44633.072916666664 | 2.32 |
| 44633.083333333336 | 2.37 |
| 44633.09375 | 2.59 |
| 44633.104166666664 | 3 |
| 44633.114583333336 | 2.93 |
| 44633.125 | 3.01 |
| 44633.135416666664 | 2.9 |
| 44633.145833333336 | 3.17 |
| 44633.15625 | 2.77 |
| 44633.166666666664 | 2.72 |
| 44633.177083333336 | 2.5 |
| 44633.1875 | 3.03 |
| 44633.197916666664 | 3.02 |
| 44633.208333333336 | 2.91 |
| 44633.21875 | 2.64 |
| 44633.229166666664 | 2.3 |
| 44633.239583333336 | 2.44 |
| 44633.25 | 2.43 |
| 44633.260416666664 | 3.92 |
| 44633.270833333336 | 4.24 |
| 44633.28125 | 4.33 |
| 44633.291666666664 | 4.93 |
| 44633.302083333336 | 4.3 |
| 44633.3125 | 4.71 |
| 44633.322916666664 | 4.09 |
| 44633.333333333336 | 4.8 |
| 44633.34375 | 4.82 |
| 44633.354166666664 | 4.37 |
| 44633.364583333336 | 3.74 |
| 44633.375 | 3.77 |
| 44633.385416666664 | 3.52 |
| 44633.395833333336 | 3.7 |
| 44633.40625 | 3.51 |
| 44633.416666666664 | 3.66 |
| 44633.427083333336 | 3.3 |
| 44633.4375 | 3.67 |
| 44633.447916666664 | 4.01 |
| 44633.458333333336 | 3.57 |
| 44633.46875 | 3.41 |
| 44633.479166666664 | 3.46 |
| 44633.489583333336 | 3.5 |
| 44633.5 | 3.44 |
| 44633.510416666664 | 2.16 |
| 44633.520833333336 | 1.96 |
| 44633.53125 | 1.46 |
| 44633.541666666664 | 1.26 |
| 44633.552083333336 | 1.49 |
| 44633.5625 | 1.3 |
| 44633.572916666664 | 1.02 |
| 44633.583333333336 | 1.15 |
| 44633.59375 | 0.94 |
| 44633.604166666664 | 1.02 |
| 44633.614583333336 | 1.05 |
| 44633.625 | 1.18 |
| 44633.635416666664 | 1.32 |
| 44633.645833333336 | 1.28 |
| 44633.65625 | 1.55 |
| 44633.666666666664 | 1.62 |
| 44633.677083333336 | 1.3 |
| 44633.6875 | 1.22 |
| 44633.697916666664 | 1.33 |
| 44633.708333333336 | 1.19 |
| 44633.71875 | 1.1 |
| 44633.729166666664 | 1.34 |
| 44633.739583333336 | 1.18 |
| 44633.75 | 1.24 |
| 44633.760416666664 | 1.09 |
| 44633.770833333336 | 0.89 |
| 44633.78125 | 0.88 |
| 44633.791666666664 | 0.89 |
| 44633.802083333336 | 0.83 |
| 44633.8125 | 0.9 |
| 44633.822916666664 | 1 |
| 44633.833333333336 | 1.21 |
| 44633.84375 | 0.85 |
| 44633.854166666664 | 1.1 |
| 44633.864583333336 | 0.82 |
| 44633.875 | 0.84 |
| 44633.885416666664 | 0.78 |
| 44633.895833333336 | 0.95 |
| 44633.90625 | 1.09 |
| 44633.916666666664 | 1.03 |
| 44633.927083333336 | 1.11 |
| 44633.9375 | 1.26 |
| 44633.947916666664 | 1.21 |
| 44633.958333333336 | 1.4 |
| 44633.96875 | 1.31 |
| 44633.979166666664 | 1.41 |
| 44633.989583333336 | 1.32 |
| 44634.0 | 1.38 |
| 44634.010416666664 | 1.41 |
| 44634.020833333336 | 1.38 |
| 44634.03125 | 1.54 |
| 44634.041666666664 | 1.5 |
| 44634.052083333336 | 1.58 |
| 44634.0625 | 1.76 |
| 44634.072916666664 | 2.09 |
| 44634.083333333336 | 2.58 |
| 44634.09375 | 2.66 |
| 44634.104166666664 | 2.88 |
| 44634.114583333336 | 3.31 |
| 44634.125 | 3.33 |
| 44634.135416666664 | 4.2 |
| 44634.145833333336 | 2.82 |
| 44634.15625 | 2.99 |
| 44634.166666666664 | 3.3 |
| 44634.177083333336 | 2.71 |
| 44634.1875 | 2.67 |
| 44634.197916666664 | 2.73 |
| 44634.208333333336 | 3.05 |
| 44634.21875 | 2.88 |
| 44634.229166666664 | 2.85 |
| 44634.239583333336 | 2.78 |
| 44634.25 | 2.32 |
| 44634.260416666664 | 2.11 |
| 44634.270833333336 | 1.93 |
| 44634.28125 | 1.87 |
| 44634.291666666664 | 1.78 |
| 44634.302083333336 | 1.82 |
| 44634.3125 | 1.49 |
| 44634.322916666664 | 1.43 |
| 44634.333333333336 | 1.42 |
| 44634.34375 | 1.4 |
| 44634.354166666664 | 1.12 |
| 44634.364583333336 | 1.07 |
| 44634.375 | 1.32 |
| 44634.385416666664 | 1.17 |
| 44634.395833333336 | 1.33 |
| 44634.40625 | 1.16 |
| 44634.416666666664 | 1.33 |
| 44634.427083333336 | 1.13 |
| 44634.4375 | 1.12 |
| 44634.447916666664 | 1.49 |
| 44634.458333333336 | 1.31 |
| 44634.46875 | 1.16 |
| 44634.479166666664 | 1.08 |
| 44634.489583333336 | 0.99 |
| 44634.5 | 0.96 |
| 44634.510416666664 | 0.98 |
| 44634.520833333336 | 0.72 |
| 44634.53125 | 0.31 |
| 44634.541666666664 | 0.44 |
| 44634.552083333336 | 0.41 |
| 44634.5625 | 0.42 |
| 44634.572916666664 | 0.53 |
| 44634.583333333336 | 0.46 |
| 44634.59375 | 0.55 |
| 44634.604166666664 | 0.58 |
| 44634.614583333336 | 0.63 |
| 44634.625 | 0.84 |
| 44634.635416666664 | 0.92 |
| 44634.645833333336 | 0.91 |
| 44634.65625 | 0.91 |
| 44634.666666666664 | 0.99 |
| 44634.677083333336 | 0.79 |
| 44634.6875 | 0.9 |
| 44634.697916666664 | 0.88 |
| 44634.708333333336 | 0.99 |
| 44634.71875 | 0.91 |
| 44634.729166666664 | 0.98 |
| 44634.739583333336 | 0.95 |
| 44634.75 | 0.92 |
| 44634.760416666664 | 0.84 |
| 44634.770833333336 | 0.88 |
| 44634.78125 | 0.7 |
| 44634.791666666664 | 0.71 |
| 44634.802083333336 | 0.69 |
| 44634.8125 | 0.72 |
| 44634.822916666664 | 0.75 |
| 44634.833333333336 | 0.78 |
| 44634.84375 | 0.76 |
| 44634.854166666664 | 0.71 |
| 44634.864583333336 | 0.73 |
| 44634.875 | 0.57 |
| 44634.885416666664 | 0.61 |
| 44634.895833333336 | 0.65 |
| 44634.90625 | 0.59 |
| 44634.916666666664 | 0.73 |
| 44634.927083333336 | 0.65 |
| 44634.9375 | 0.59 |
| 44634.947916666664 | 0.57 |
| 44634.958333333336 | 0.74 |
| 44634.96875 | 0.92 |
| 44634.979166666664 | 0.9 |
| 44634.989583333336 | 0.95 |
| 44635.0 | 0.7 |
| 44635.010416666664 | 0.85 |
| 44635.020833333336 | 0.77 |
| 44635.03125 | 0.89 |
| 44635.041666666664 | 0.95 |
| 44635.052083333336 | 0.96 |
| 44635.0625 | 0.77 |
| 44635.072916666664 | 0.81 |
| 44635.083333333336 | 1 |
| 44635.09375 | 1.05 |
| 44635.104166666664 | 1.19 |
| 44635.114583333336 | 1.44 |
| 44635.125 | 1.57 |
| 44635.135416666664 | 1.55 |
| 44635.145833333336 | 1.9 |
| 44635.15625 | 1.65 |
| 44635.166666666664 | 2.02 |
| 44635.177083333336 | 1.69 |
| 44635.1875 | 1.78 |
| 44635.197916666664 | 1.69 |
| 44635.208333333336 | 1.61 |
| 44635.21875 | 1.88 |
| 44635.229166666664 | 1.42 |
| 44635.239583333336 | 1.63 |
| 44635.25 | 1.46 |
| 44635.260416666664 | 1.47 |
| 44635.270833333336 | 1.01 |
| 44635.28125 | 1.13 |
| 44635.291666666664 | 1.05 |
| 44635.302083333336 | 0.95 |
| 44635.3125 | 0.86 |
| 44635.322916666664 | 0.72 |
| 44635.333333333336 | 0.74 |
| 44635.34375 | 0.61 |
| 44635.354166666664 | 0.54 |
| 44635.364583333336 | 0.48 |
| 44635.375 | 0.43 |
| 44635.385416666664 | 0.5 |
| 44635.395833333336 | 0.43 |
| 44635.40625 | 0.35 |
| 44635.416666666664 | 0.54 |
| 44635.427083333336 | 0.61 |
| 44635.4375 | 0.52 |
| 44635.447916666664 | 0.68 |
| 44635.458333333336 | 0.74 |
| 44635.46875 | 0.77 |
| 44635.479166666664 | 1.05 |
| 44635.489583333336 | 0.61 |
| 44635.5 | 0.58 |
| 44635.510416666664 | 0.72 |
| 44635.520833333336 | 0.44 |
| 44635.53125 | 0.34 |
| 44635.541666666664 | 0.45 |
| 44635.552083333336 | 0.27 |
| 44635.5625 | 0.27 |
| 44635.572916666664 | 0.27 |
| 44635.583333333336 | 0.1 |
| 44635.59375 | 0.32 |
| 44635.604166666664 | 0.27 |
| 44635.614583333336 | 0.31 |
| 44635.625 | 0.3 |
| 44635.635416666664 | 0.47 |
| 44635.645833333336 | 0.5 |
| 44635.65625 | 0.39 |
| 44635.666666666664 | 0.54 |
| 44635.677083333336 | 0.43 |
| 44635.6875 | 0.49 |
| 44635.697916666664 | 0.59 |
| 44635.708333333336 | 0.71 |
| 44635.71875 | 0.48 |
| 44635.729166666664 | 0.5 |
| 44635.739583333336 | 0.55 |
| 44635.75 | 0.68 |
| 44635.760416666664 | 0.62 |
| 44635.770833333336 | 0.64 |
| 44635.78125 | 0.56 |
| 44635.791666666664 | 0.49 |
| 44635.802083333336 | 0.48 |
| 44635.8125 | 0.5 |
| 44635.822916666664 | 0.67 |
| 44635.833333333336 | 0.71 |
| 44635.84375 | 0.56 |
| 44635.854166666664 | 0.56 |
| 44635.864583333336 | 0.58 |
| 44635.875 | 0.41 |
| 44635.885416666664 | 0.48 |
| 44635.895833333336 | 0.53 |
| 44635.90625 | 0.46 |
| 44635.916666666664 | 0.57 |
| 44635.927083333336 | 0.44 |
| 44635.9375 | 0.56 |
| 44635.947916666664 | 0.52 |
| 44635.958333333336 | 0.55 |
| 44635.96875 | 0.64 |
| 44635.979166666664 | 0.69 |
| 44635.989583333336 | 0.95 |
| 44636.0 | 0.57 |
| 44636.010416666664 | 0.88 |
| 44636.020833333336 | 0.71 |
| 44636.03125 | 0.64 |
| 44636.041666666664 | 0.74 |
| 44636.052083333336 | 0.74 |
| 44636.0625 | 0.66 |
| 44636.072916666664 | 0.86 |
| 44636.083333333336 | 0.89 |
| 44636.09375 | 0.99 |
| 44636.104166666664 | 0.88 |
| 44636.114583333336 | 0.79 |
| 44636.125 | 0.95 |
| 44636.135416666664 | 1.18 |
| 44636.145833333336 | 1.37 |
| 44636.15625 | 1.4 |
| 44636.166666666664 | 1.43 |
| 44636.177083333336 | 1.46 |
| 44636.1875 | 1.5 |
| 44636.197916666664 | 1.54 |
| 44636.208333333336 | 1.59 |
| 44636.21875 | 1.73 |
| 44636.229166666664 | 1.74 |
| 44636.239583333336 | 1.79 |
| 44636.25 | 1.96 |
| 44636.260416666664 | 1.73 |
| 44636.270833333336 | 1.7 |
| 44636.28125 | 1.74 |
| 44636.291666666664 | 1.59 |
| 44636.302083333336 | 1.51 |
| 44636.3125 | 1.33 |
| 44636.322916666664 | 1.36 |
| 44636.333333333336 | 1.05 |
| 44636.34375 | 1.16 |
| 44636.354166666664 | 0.84 |
| 44636.364583333336 | 0.91 |
| 44636.375 | 0.6 |
| 44636.385416666664 | 0.55 |
| 44636.395833333336 | 0.42 |
| 44636.40625 | 0.53 |
| 44636.416666666664 | 0.44 |
| 44636.427083333336 | 0.5 |
| 44636.4375 | 0.43 |
| 44636.447916666664 | 0.55 |
| 44636.458333333336 | 0.55 |
| 44636.46875 | 0.72 |
| 44636.479166666664 | 0.78 |
| 44636.489583333336 | 0.73 |
| 44636.5 | 0.79 |
| 44636.510416666664 | 0.89 |
| 44636.520833333336 | 0.64 |
| 44636.53125 | 0.92 |
| 44636.541666666664 | 0.77 |
| 44636.552083333336 | 0.77 |
| 44636.5625 | 0.66 |
| 44636.572916666664 | 0.5 |
| 44636.583333333336 | 0.52 |
| 44636.59375 | 0.65 |
| 44636.604166666664 | 0.66 |
| 44636.614583333336 | 0.5 |
| 44636.625 | 3.14 |
| 44636.635416666664 | 0.44 |
| 44636.645833333336 | 0.64 |
| 44636.65625 | 0.76 |
| 44636.666666666664 | 0.68 |
| 44636.677083333336 | 0.82 |
| 44636.6875 | 0.88 |
| 44636.697916666664 | 1 |
| 44636.708333333336 | 0.94 |
| 44636.71875 | 0.84 |
| 44636.729166666664 | 0.93 |
| 44636.739583333336 | 1.12 |
| 44636.75 | 1.07 |
| 44636.760416666664 | 1.22 |
| 44636.770833333336 | 1.61 |
| 44636.78125 | 1.37 |
| 44636.791666666664 | 1.34 |
| 44636.802083333336 | 0.95 |
| 44636.8125 | 1.04 |
| 44636.822916666664 | 1.07 |
| 44636.833333333336 | 1.34 |
| 44636.84375 | 1.12 |
| 44636.854166666664 | 0.98 |
| 44636.864583333336 | 0.71 |
| 44636.875 | 0.97 |
| 44636.885416666664 | 0.89 |
| 44636.895833333336 | 0.96 |
| 44636.90625 | 0.78 |
| 44636.916666666664 | 0.71 |
| 44636.927083333336 | 0.7 |
| 44636.9375 | 0.72 |
| 44636.947916666664 | 0.68 |
| 44636.958333333336 | 0.47 |
| 44636.96875 | 0.52 |
| 44636.979166666664 | 0.55 |
| 44636.989583333336 | 0.63 |
| 44637.0 | 0.66 |
| 44637.010416666664 | 0.76 |
| 44637.020833333336 | 0.83 |
| 44637.03125 | 0.76 |
| 44637.041666666664 | 0.86 |
| 44637.052083333336 | 0.64 |
| 44637.0625 | 0.69 |
| 44637.072916666664 | 0.62 |
| 44637.083333333336 | 0.68 |
| 44637.09375 | 0.66 |
| 44637.104166666664 | 0.76 |
| 44637.114583333336 | 0.73 |
| 44637.125 | 0.77 |
| 44637.135416666664 | 0.78 |
| 44637.145833333336 | 0.98 |
| 44637.15625 | 1.27 |
| 44637.166666666664 | 1.3 |
| 44637.177083333336 | 1.43 |
| 44637.1875 | 1.71 |
| 44637.197916666664 | 1.61 |
| 44637.208333333336 | 1.71 |
| 44637.21875 | 1.77 |
| 44637.229166666664 | 1.75 |
| 44637.239583333336 | 1.82 |
| 44637.25 | 1.77 |
| 44637.260416666664 | 2.07 |
| 44637.270833333336 | 2.28 |
| 44637.28125 | 2.37 |
| 44637.291666666664 | 2.19 |
| 44637.302083333336 | 1.83 |
| 44637.3125 | 1.62 |
| 44637.322916666664 | 1.98 |
| 44637.333333333336 | 1.7 |
| 44637.34375 | 1.44 |
| 44637.354166666664 | 1.43 |
| 44637.364583333336 | 1.14 |
| 44637.375 | 1.02 |
| 44637.385416666664 | 1.07 |
| 44637.395833333336 | 0.98 |
| 44637.40625 | 0.78 |
| 44637.416666666664 | 0.74 |
| 44637.427083333336 | 0.85 |
| 44637.4375 | 0.77 |
| 44637.447916666664 | 0.63 |
| 44637.458333333336 | 0.67 |
| 44637.46875 | 0.73 |
| 44637.479166666664 | 0.86 |
| 44637.489583333336 | 0.79 |
| 44637.5 | 0.89 |
| 44637.510416666664 | 0.83 |
| 44637.520833333336 | 0.84 |
| 44637.53125 | 0.88 |
| 44637.541666666664 | 1.1 |
| 44637.552083333336 | 1.2 |
| 44637.5625 | 0.9 |
| 44637.572916666664 | 0.85 |
| 44637.583333333336 | 0.79 |
| 44637.59375 | 0.82 |
| 44637.604166666664 | 0.89 |
| 44637.614583333336 | 0.46 |
| 44637.625 | 1.26 |
| 44637.635416666664 | 0.52 |
| 44637.645833333336 | 0.74 |
| 44637.65625 | 0.73 |
| 44637.666666666664 | 0.63 |
| 44637.677083333336 | 0.83 |
| 44637.6875 | 1.07 |
| 44637.697916666664 | 0.99 |
| 44637.708333333336 | 1.17 |
| 44637.71875 | 1.36 |
| 44637.729166666664 | 1.6 |
| 44637.739583333336 | 1.94 |
| 44637.75 | 1.77 |
| 44637.760416666664 | 1.94 |
| 44637.770833333336 | 2.58 |
| 44637.78125 | 2.6 |
| 44637.791666666664 | 3.02 |
| 44637.802083333336 | 2.66 |
| 44637.8125 | 4.3 |
| 44637.822916666664 | 2.82 |
| 44637.833333333336 | 2.65 |
| 44637.84375 | 2.75 |
| 44637.854166666664 | 2.06 |
| 44637.864583333336 | 1.91 |
| 44637.875 | 1.63 |
| 44637.885416666664 | 1.43 |
| 44637.895833333336 | 1.18 |
| 44637.90625 | 1.22 |
| 44637.916666666664 | 1.66 |
| 44637.927083333336 | 1.28 |
| 44637.9375 | 3.02 |
| 44637.947916666664 | 0.82 |
| 44637.958333333336 | 1.22 |
| 44637.96875 | 0.83 |
| 44637.979166666664 | 0.82 |
| 44637.989583333336 | 0.75 |
| 44638.0 | 0.89 |
| 44638.010416666664 | 1.08 |
| 44638.020833333336 | 1.08 |
| 44638.03125 | 0.87 |
| 44638.041666666664 | 1.07 |
| 44638.052083333336 | 1.31 |
| 44638.0625 | 1.43 |
| 44638.072916666664 | 1.41 |
| 44638.083333333336 | 3.4 |
| 44638.09375 | 1.81 |
| 44638.104166666664 | 3.8 |
| 44638.114583333336 | 3.22 |
| 44638.125 | 2.42 |
| 44638.135416666664 | 1.72 |
| 44638.145833333336 | 4.17 |
| 44638.15625 | 2.62 |
| 44638.166666666664 | 1.74 |
| 44638.177083333336 | 2.62 |
| 44638.1875 | 3.04 |
| 44638.197916666664 | 3.25 |
| 44638.208333333336 | 2.25 |
| 44638.21875 | 2 |
| 44638.229166666664 | 2.69 |
| 44638.239583333336 | 2.08 |
| 44638.25 | 2.12 |
| 44638.260416666664 | 2.42 |
| 44638.270833333336 | 2.44 |
| 44638.28125 | 3.19 |
| 44638.291666666664 | 4.08 |
| 44638.302083333336 | 4.95 |
| 44638.3125 | 2.91 |
| 44638.322916666664 | 2.31 |
| 44638.333333333336 | 2.09 |
| 44638.34375 | 2.17 |
| 44638.354166666664 | 2.02 |
| 44638.364583333336 | 1.9 |
| 44638.375 | 2.08 |
| 44638.385416666664 | 1.68 |
| 44638.395833333336 | 1.42 |
| 44638.40625 | 1.27 |
| 44638.416666666664 | 2.64 |
| 44638.427083333336 | 1.21 |
| 44638.4375 | 1.01 |
| 44638.447916666664 | 1.12 |
| 44638.458333333336 | 1.07 |
| 44638.46875 | 0.94 |
| 44638.479166666664 | 1.34 |
| 44638.489583333336 | 0.93 |
| 44638.5 | 1.33 |
| 44638.510416666664 | 1.23 |
| 44638.520833333336 | 1.05 |
| 44638.53125 | 0.98 |
| 44638.541666666664 | 1.02 |
| 44638.552083333336 | 0.88 |
| 44638.5625 | 0.73 |
| 44638.572916666664 | 1.21 |
| 44638.583333333336 | 0.77 |
| 44638.59375 | 1.01 |
| 44638.604166666664 | 1.05 |
| 44638.614583333336 | 1.5 |
| 44638.625 | 1.78 |
| 44638.635416666664 | 1.89 |
| 44638.645833333336 | 2.94 |
| 44638.65625 | 0.83 |
| 44638.666666666664 | 1.24 |
| 44638.677083333336 | 1.22 |
| 44638.6875 | 1.84 |
| 44638.697916666664 | 1.18 |
| 44638.708333333336 | 2.19 |
| 44638.71875 | 1.2 |
| 44638.729166666664 | 1.72 |
| 44638.739583333336 | 2.26 |
| 44638.75 | 1.94 |
| 44638.760416666664 | 1.61 |
| 44638.770833333336 | 1.71 |
| 44638.78125 | 2.3 |
| 44638.791666666664 | 2.7 |
| 44638.802083333336 | 2.73 |
| 44638.8125 | 3.08 |
| 44638.822916666664 | 4.32 |
| 44638.833333333336 | 3.52 |
| 44638.84375 | 3.12 |
| 44638.854166666664 | 2.89 |
| 44638.864583333336 | 2.66 |
| 44638.875 | 2.51 |
| 44638.885416666664 | 1.89 |
| 44638.895833333336 | 1.74 |
| 44638.90625 | 1.51 |
| 44638.916666666664 | 1.41 |
| 44638.927083333336 | 1.78 |
| 44638.9375 | 1.15 |
| 44638.947916666664 | 1.04 |
| 44638.958333333336 | 1.02 |
| 44638.96875 | 0.77 |
| 44638.979166666664 | 0.86 |
| 44638.989583333336 | 0.84 |
| 44639.0 | 0.93 |
| 44639.010416666664 | 0.75 |
| 44639.020833333336 | 0.79 |
| 44639.03125 | 0.73 |
| 44639.041666666664 | 0.67 |
| 44639.052083333336 | 0.66 |
| 44639.0625 | 0.86 |
| 44639.072916666664 | 0.68 |
| 44639.083333333336 | 1.22 |
| 44639.09375 | 1.71 |
| 44639.104166666664 | 1.52 |
| 44639.114583333336 | 0.99 |
| 44639.125 | 1.03 |
| 44639.135416666664 | 0.87 |
| 44639.145833333336 | 1.04 |
| 44639.15625 | 1.15 |
| 44639.166666666664 | 1.41 |
| 44639.177083333336 | 1.12 |
| 44639.1875 | 1.67 |
| 44639.197916666664 | 1.75 |
| 44639.208333333336 | 1.58 |
| 44639.21875 | 2.4 |
| 44639.229166666664 | 1.88 |
| 44639.239583333336 | 2.71 |
| 44639.25 | 2.48 |
| 44639.260416666664 | 2.15 |
| 44639.270833333336 | 2.45 |
| 44639.28125 | 2.39 |
| 44639.291666666664 | 2.35 |
| 44639.302083333336 | 2.71 |
| 44639.3125 | 3.03 |
| 44639.322916666664 | 3.49 |
| 44639.333333333336 | 3.7 |
| 44639.34375 | 3.48 |
| 44639.354166666664 | 2.41 |
| 44639.364583333336 | 3.38 |
| 44639.375 | 4.6 |
| 44639.385416666664 | 582.63 |
| 44639.395833333336 | 2.34 |
| 44639.40625 | 2.34 |
| 44639.416666666664 | 1.94 |
| 44639.427083333336 | 1.51 |
| 44639.4375 | 1.42 |
| 44639.447916666664 | 1.36 |
| 44639.458333333336 | 1.38 |
| 44639.46875 | 1.64 |
| 44639.479166666664 | 3.92 |
| 44639.489583333336 | 1.07 |
| 44639.5 | 1.22 |
| 44639.510416666664 | 1.22 |
| 44639.520833333336 | 1 |
| 44639.53125 | 1.14 |
| 44639.541666666664 | 1.03 |
| 44639.552083333336 | 0.97 |
| 44639.5625 | 1.15 |
| 44639.572916666664 | 1 |
| 44639.583333333336 | 0.72 |
| 44639.59375 | 0.58 |
| 44639.604166666664 | 0.69 |
| 44639.614583333336 | 2.86 |
| 44639.625 | 1.49 |
| 44639.635416666664 | 2.18 |
| 44639.645833333336 | 0.9 |
| 44639.65625 | 2.65 |
| 44639.666666666664 | 3.46 |
| 44639.677083333336 | 1.83 |
| 44639.6875 | 2.52 |
| 44639.697916666664 | 1.89 |
| 44639.708333333336 | 3.43 |
| 44639.71875 | 4.4 |
| 44639.729166666664 | 4.46 |
| 44639.739583333336 | 2.62 |
| 44639.75 | 4.36 |
| 44639.760416666664 | 19.95 |
| 44639.770833333336 | 111.18 |
| 44639.78125 | 5.62 |
| 44639.791666666664 | 2.72 |
| 44639.802083333336 | 2.33 |
| 44639.8125 | 4.88 |
| 44639.822916666664 | 6.07 |
| 44639.833333333336 | 3.42 |
| 44639.84375 | 4.78 |
| 44639.854166666664 | 2.92 |
| 44639.864583333336 | 3.97 |
| 44639.875 | 3.47 |
| 44639.885416666664 | 3.78 |
| 44639.895833333336 | 2.86 |
| 44639.90625 | 2.58 |
| 44639.916666666664 | 2.8 |
| 44639.927083333336 | 2.73 |
| 44639.9375 | 2 |
| 44639.947916666664 | 2.19 |
| 44639.958333333336 | 1.83 |
| 44639.96875 | 1.39 |
| 44639.979166666664 | 1.61 |
| 44639.989583333336 | 1.93 |
| 44640.0 | 1.56 |
| 44640.010416666664 | 1.33 |
| 44640.020833333336 | 1.26 |
| 44640.03125 | 1.45 |
| 44640.041666666664 | 1.22 |
| 44640.052083333336 | 1.89 |
| 44640.0625 | 1.88 |
| 44640.072916666664 | 1.19 |
| 44640.083333333336 | 2.27 |
| 44640.09375 | 3 |
| 44640.104166666664 | 1.06 |
| 44640.114583333336 | 2.99 |
| 44640.125 | 1.15 |
| 44640.135416666664 | 1.1 |
| 44640.145833333336 | 1.15 |
| 44640.15625 | 2.52 |
| 44640.166666666664 | 1.41 |
| 44640.177083333336 | 3.95 |
| 44640.1875 | 2.38 |
| 44640.197916666664 | 1.76 |
| 44640.208333333336 | 7.9 |
| 44640.21875 | 1.97 |
| 44640.229166666664 | 4.46 |
| 44640.239583333336 | 4.37 |
| 44640.25 | 5.79 |
| 44640.260416666664 | 4.8 |
| 44640.270833333336 | 4.45 |
| 44640.28125 | 3.37 |
| 44640.291666666664 | 3.09 |
| 44640.302083333336 | 4.47 |
| 44640.3125 | 2.84 |
| 44640.322916666664 | 3.11 |
| 44640.333333333336 | 2.88 |
| 44640.34375 | 3.25 |
| 44640.354166666664 | 4.68 |
| 44640.364583333336 | 2.9 |
| 44640.375 | 3.05 |
| 44640.385416666664 | 2.77 |
| 44640.395833333336 | 2.74 |
| 44640.40625 | 2.52 |
| 44640.416666666664 | 3.39 |
| 44640.427083333336 | 2.45 |
| 44640.4375 | 2.45 |
| 44640.447916666664 | 1.87 |
| 44640.458333333336 | 1.75 |
| 44640.46875 | 1.66 |
| 44640.479166666664 | 1.71 |
| 44640.489583333336 | 4.37 |
| 44640.5 | 1.59 |
| 44640.510416666664 | 1.6 |
| 44640.520833333336 | 1.87 |
| 44640.53125 | 1.82 |
| 44640.541666666664 | 1.52 |
| 44640.552083333336 | 2 |
| 44640.5625 | 0.95 |
| 44640.572916666664 | 1.85 |
| 44640.583333333336 | 1.37 |
| 44640.59375 | 1.34 |
| 44640.604166666664 | 0.94 |
| 44640.614583333336 | 1.48 |
| 44640.625 | 1.23 |
| 44640.635416666664 | 1.54 |
| 44640.645833333336 | 1.76 |
| 44640.65625 | 1.03 |
| 44640.666666666664 | 0.98 |
| 44640.677083333336 | 1.64 |
| 44640.6875 | 1.34 |
| 44640.697916666664 | 1.24 |
| 44640.708333333336 | 4.58 |
| 44640.71875 | 4.77 |
| 44640.729166666664 | 17.13 |
| 44640.739583333336 | 3.41 |
| 44640.75 | 31.46 |
| 44640.760416666664 | 16.56 |
| 44640.770833333336 | 4.06 |
| 44640.78125 | 81.31 |
| 44640.791666666664 | 8.62 |
| 44640.802083333336 | 254.42 |
| 44640.8125 | 2.97 |
| 44640.822916666664 | 24.16 |
| 44640.833333333336 | 6.1 |
| 44640.84375 | 4.76 |
| 44640.854166666664 | 3.69 |
| 44640.864583333336 | 2.92 |
| 44640.875 | 2.84 |
| 44640.885416666664 | 3.07 |
| 44640.895833333336 | 3.5 |
| 44640.90625 | 3.21 |
| 44640.916666666664 | 2.49 |
| 44640.927083333336 | 2.42 |
| 44640.9375 | 2.24 |
| 44640.947916666664 | 1.83 |
| 44640.958333333336 | 1.84 |
| 44640.96875 | 1.77 |
| 44640.979166666664 | 2.03 |
| 44640.989583333336 | 1.75 |
| 44641.0 | 2.47 |
| 44641.010416666664 | 1.23 |
| 44641.020833333336 | 1.09 |
| 44641.03125 | 1.24 |
| 44641.041666666664 | 1.11 |
| 44641.052083333336 | 1.48 |
| 44641.0625 | 1.38 |
| 44641.072916666664 | 1.38 |
| 44641.083333333336 | 1.97 |
| 44641.09375 | 2.9 |
| 44641.104166666664 | 1.59 |
| 44641.114583333336 | 1.38 |
| 44641.125 | 1.52 |
| 44641.135416666664 | 1.48 |
| 44641.145833333336 | 1.35 |
| 44641.15625 | 1.67 |
| 44641.166666666664 | 1.63 |
| 44641.177083333336 | 2.02 |
| 44641.1875 | 1.63 |
| 44641.197916666664 | 4.62 |
| 44641.208333333336 | 2.23 |
| 44641.21875 | 4.29 |
| 44641.229166666664 | 2.72 |
| 44641.239583333336 | 2.91 |
| 44641.25 | 2 |
| 44641.260416666664 | 2.11 |
| 44641.270833333336 | 3.53 |
| 44641.28125 | 2.74 |
| 44641.291666666664 | 219.83 |
| 44641.302083333336 | 62.96 |
| 44641.3125 | 5.52 |
| 44641.322916666664 | 3.59 |
| 44641.333333333336 | 20.88 |
| 44641.34375 | 4.13 |
| 44641.354166666664 | 3.28 |
| 44641.364583333336 | 19.71 |
| 44641.375 | 3.92 |
| 44641.385416666664 | 3.43 |
| 44641.395833333336 | 2.32 |
| 44641.40625 | 2.51 |
| 44641.416666666664 | 2.12 |
| 44641.427083333336 | 2.46 |
| 44641.4375 | 2.3 |
| 44641.447916666664 | 2.65 |
| 44641.458333333336 | 2.24 |
| 44641.46875 | 2.24 |
| 44641.479166666664 | 3.28 |
| 44641.489583333336 | 1.56 |
| 44641.5 | 1.55 |
| 44641.510416666664 | 1.67 |
| 44641.520833333336 | 1.49 |
| 44641.53125 | 1.43 |
| 44641.541666666664 | 0.91 |
| 44641.552083333336 | 1.1 |
| 44641.5625 | 1.22 |
| 44641.572916666664 | 0.7 |
| 44641.583333333336 | 0.72 |
| 44641.59375 | 0.47 |
| 44641.604166666664 | 0.62 |
| 44641.614583333336 | 0.37 |
| 44641.625 | 0.44 |
| 44641.635416666664 | 0.48 |
| 44641.645833333336 | 0.39 |
| 44641.65625 | 25.25 |
| 44641.666666666664 | 1.21 |
| 44641.677083333336 | 0.62 |
| 44641.6875 | 1.64 |
| 44641.697916666664 | 4.12 |
| 44641.708333333336 | 4.06 |
| 44641.71875 | 3.05 |
| 44641.729166666664 | 6.47 |
| 44641.739583333336 | 7.39 |
| 44641.75 | 4.54 |
| 44641.760416666664 | 3.66 |
| 44641.770833333336 | 4.76 |
| 44641.78125 | 1.75 |
| 44641.791666666664 | 2.38 |
| 44641.802083333336 | 2.78 |
| 44641.8125 | 3.77 |
| 44641.822916666664 | 15.44 |
| 44641.833333333336 | 1.08 |
| 44641.84375 | 11.16 |
| 44641.854166666664 | 29.99 |
| 44641.864583333336 | 145.34 |
| 44641.875 | 13.39 |
| 44641.885416666664 | 6.2 |
| 44641.895833333336 | 3.8 |
| 44641.90625 | 2.32 |
| 44641.916666666664 | 2.33 |
| 44641.927083333336 | 2.23 |
| 44641.9375 | 3.76 |
| 44641.947916666664 | 2.57 |
| 44641.958333333336 | 1.84 |
| 44641.96875 | 1.85 |
| 44641.979166666664 | 2.08 |
| 44641.989583333336 | 3.2 |
| 44642.0 | 1.53 |
| 44642.010416666664 | 1.43 |
| 44642.020833333336 | 0.96 |
| 44642.03125 | 0.73 |
| 44642.041666666664 | 0.89 |
| 44642.052083333336 | 2.29 |
| 44642.0625 | 1.54 |
| 44642.072916666664 | 1.82 |
| 44642.083333333336 | 1.93 |
| 44642.09375 | 1.04 |
| 44642.104166666664 | 1.31 |
| 44642.114583333336 | 1.93 |
| 44642.125 | 0.85 |
| 44642.135416666664 | 1.18 |
| 44642.145833333336 | 0.96 |
| 44642.15625 | 0.86 |
| 44642.166666666664 | 0.83 |
| 44642.177083333336 | 1.05 |
| 44642.1875 | 1.15 |
| 44642.197916666664 | 2 |
| 44642.208333333336 | 2.19 |
| 44642.21875 | 4.43 |
| 44642.229166666664 | 2.4 |
| 44642.239583333336 | 3.08 |
| 44642.25 | 1.9 |
| 44642.260416666664 | 1.72 |
| 44642.270833333336 | 1.3 |
| 44642.28125 | 2.21 |
| 44642.291666666664 | 1.75 |
| 44642.302083333336 | 2.91 |
| 44642.3125 | 3.03 |
| 44642.322916666664 | 17.95 |
| 44642.333333333336 | 2.03 |
| 44642.34375 | 64.28 |
| 44642.354166666664 | 152.82 |
| 44642.364583333336 | 6.27 |
| 44642.375 | 14.72 |
| 44642.385416666664 | 5.55 |
| 44642.395833333336 | 4.36 |
| 44642.40625 | 98.85 |
| 44642.416666666664 | 576.88 |
| 44642.427083333336 | 2.99 |
| 44642.4375 | 7.26 |
| 44642.447916666664 | 2.41 |
| 44642.458333333336 | 1.89 |
| 44642.46875 | 2.11 |
| 44642.479166666664 | 2.51 |
| 44642.489583333336 | 2.2 |
| 44642.5 | 3.93 |
| 44642.510416666664 | 2.64 |
| 44642.520833333336 | 1.48 |
| 44642.53125 | 2.38 |
| 44642.541666666664 | 1.44 |
| 44642.552083333336 | 1.05 |
| 44642.5625 | 1.13 |
| 44642.572916666664 | 0.63 |
| 44642.583333333336 | 0.43 |
| 44642.59375 | 0.4 |
| 44642.604166666664 | 1.97 |
| 44642.614583333336 | 0.85 |
| 44642.625 | 0.61 |
| 44642.635416666664 | 0.56 |
| 44642.645833333336 | 0.36 |
| 44642.65625 | 0.87 |
| 44642.666666666664 | 1.31 |
| 44642.677083333336 | 3.17 |
| 44642.6875 | 0.65 |
| 44642.697916666664 | 2.68 |
| 44642.708333333336 | 0.68 |
| 44642.71875 | 6.04 |
| 44642.729166666664 | 0.81 |
| 44642.739583333336 | 4.77 |
| 44642.75 | 8.57 |
| 44642.760416666664 | 4.22 |
| 44642.770833333336 | 3.16 |
| 44642.78125 | 36.11 |
| 44642.791666666664 | 2.34 |
| 44642.802083333336 | 3.69 |
| 44642.8125 | 77.91 |
| 44642.822916666664 | 44.22 |
| 44642.833333333336 | 2.43 |
| 44642.84375 | 3.34 |
| 44642.854166666664 | 3.73 |
| 44642.864583333336 | 3.57 |
| 44642.875 | 113.08 |
| 44642.885416666664 | 8.85 |
| 44642.895833333336 | 5.6 |
| 44642.90625 | 2.11 |
| 44642.916666666664 | 8.78 |
| 44642.927083333336 | 1.51 |
| 44642.9375 | 4.31 |
| 44642.947916666664 | 3.16 |
| 44642.958333333336 | 4.06 |
| 44642.96875 | 3.3 |
| 44642.979166666664 | 2.44 |
| 44642.989583333336 | 2.53 |
| 44643.0 | 2.1 |
| 44643.010416666664 | 1.99 |
| 44643.020833333336 | 2.45 |
| 44643.03125 | 1.33 |
| 44643.041666666664 | 1.43 |
| 44643.052083333336 | 0.89 |
| 44643.0625 | 0.85 |
| 44643.072916666664 | 1.08 |
| 44643.083333333336 | 1.11 |
| 44643.09375 | 1.95 |
| 44643.104166666664 | 0.89 |
| 44643.114583333336 | 1.05 |
| 44643.125 | 1.85 |
| 44643.135416666664 | 1.33 |
| 44643.145833333336 | 1.4 |
| 44643.15625 | 0.78 |
| 44643.166666666664 | 1.45 |
| 44643.177083333336 | 0.88 |
| 44643.1875 | 0.91 |
| 44643.197916666664 | 0.99 |
| 44643.208333333336 | 1.01 |
| 44643.21875 | 1.89 |
| 44643.229166666664 | 3.09 |
| 44643.239583333336 | 3.36 |
| 44643.25 | 2.25 |
| 44643.260416666664 | 4.56 |
| 44643.270833333336 | 627.27 |
| 44643.28125 | 3.25 |
| 44643.291666666664 | 3.28 |
| 44643.302083333336 | 3.47 |
| 44643.3125 | 289.28 |
| 44643.322916666664 | 1.19 |
| 44643.333333333336 | 1.24 |
| 44643.34375 | 4.92 |
| 44643.354166666664 | 0.72 |
| 44643.364583333336 | 263 |
| 44643.375 | 29.57 |
| 44643.385416666664 | 9.36 |
| 44643.395833333336 | 14.07 |
| 44643.40625 | 4.21 |
| 44643.416666666664 | 75.79 |
| 44643.427083333336 | 5.15 |
| 44643.4375 | 3.83 |
| 44643.447916666664 | 14.65 |
| 44643.458333333336 | 11.64 |
| 44643.46875 | 129.13 |
| 44643.479166666664 | 3.13 |
| 44643.489583333336 | 3.09 |
| 44643.5 | 27.68 |
| 44643.510416666664 | 3.48 |
| 44643.520833333336 | 1.87 |
| 44643.53125 | 1.92 |
| 44643.541666666664 | 4.84 |
| 44643.552083333336 | 3.22 |
| 44643.5625 | 3.9 |
| 44643.572916666664 | 4.19 |
| 44643.583333333336 | 1.14 |
| 44643.59375 | 3.6 |
| 44643.604166666664 | 1.2 |
| 44643.614583333336 | 0.16 |
| 44643.625 | 2.31 |
| 44643.635416666664 | 4.72 |
| 44643.645833333336 | 0.7 |
| 44643.65625 | 4.09 |
| 44643.666666666664 | 5.14 |
| 44643.677083333336 | 1.74 |
| 44643.6875 | 2.13 |
| 44643.697916666664 | 3.29 |
| 44643.708333333336 | 1.31 |
| 44643.71875 | 44.96 |
| 44643.729166666664 | 3.21 |
| 44643.739583333336 | 2.66 |
| 44643.75 | 0.38 |
| 44643.760416666664 | 2.12 |
| 44643.770833333336 | 125.96 |
| 44643.78125 | 1.36 |
| 44643.791666666664 | 114.57 |
| 44643.802083333336 | 0.9 |
| 44643.8125 | 2.96 |
| 44643.822916666664 | 4.63 |
| 44643.833333333336 | 19.33 |
| 44643.84375 | 6.68 |
| 44643.854166666664 | 98.97 |
| 44643.864583333336 | 2.15 |
| 44643.875 | 35.08 |
| 44643.885416666664 | 2.42 |
| 44643.895833333336 | 3.05 |
| 44643.90625 | 3.05 |
| 44643.916666666664 | 3.63 |
| 44643.927083333336 | 1.65 |
| 44643.9375 | 94.52 |
| 44643.947916666664 | 11.56 |
| 44643.958333333336 | 4.11 |
| 44643.96875 | 179.87 |
| 44643.979166666664 | 14.72 |
| 44643.989583333336 | 35.64 |
| 44644.0 | 1.83 |
| 44644.010416666664 | 2.56 |
| 44644.020833333336 | 4.4 |
| 44644.03125 | 1.5 |
| 44644.041666666664 | 2.4 |
| 44644.052083333336 | 2.47 |
| 44644.0625 | 3.6 |
| 44644.072916666664 | 24.66 |
| 44644.083333333336 | 7.19 |
| 44644.09375 | 1.72 |
| 44644.104166666664 | 3.56 |
| 44644.114583333336 | 1.76 |
| 44644.125 | 2.82 |
| 44644.135416666664 | 4.46 |
| 44644.145833333336 | 1.88 |
| 44644.15625 | 2.45 |
| 44644.166666666664 | 2.54 |
| 44644.177083333336 | 2.99 |
| 44644.1875 | 133.92 |
| 44644.197916666664 | 66.29 |
| 44644.208333333336 | 8.06 |
| 44644.21875 | 6.8 |
| 44644.229166666664 | 4.82 |
| 44644.239583333336 | 5.64 |
| 44644.25 | 5.32 |
| 44644.260416666664 | 2.73 |
| 44644.270833333336 | 8.08 |
| 44644.28125 | 3.03 |
| 44644.291666666664 | 0.89 |
| 44644.302083333336 | 0.73 |
| 44644.3125 | 3.62 |
| 44644.322916666664 | 62.22 |
| 44644.333333333336 | 25.29 |
| 44644.34375 | 4.94 |
| 44644.354166666664 | 125.83 |
| 44644.364583333336 | 4.48 |
| 44644.375 | 1.1 |
| 44644.385416666664 | 2.45 |
| 44644.395833333336 | 3.73 |
| 44644.40625 | 24.22 |
| 44644.416666666664 | 4.12 |
| 44644.427083333336 | 5.72 |
| 44644.4375 | 5.74 |
| 44644.447916666664 | 33.47 |
| 44644.458333333336 | 4.83 |
| 44644.46875 | 1.75 |
| 44644.479166666664 | 6.32 |
| 44644.489583333336 | 17.27 |
| 44644.5 | 4.31 |
| 44644.510416666664 | 170.75 |
| 44644.520833333336 | 4.85 |
| 44644.53125 | 4.22 |
| 44644.541666666664 | 29.79 |
| 44644.552083333336 | 3.14 |
| 44644.5625 | 4.06 |
| 44644.572916666664 | 2.68 |
| 44644.583333333336 | 2.65 |
| 44644.59375 | 2.65 |
| 44644.604166666664 | 2.73 |
| 44644.614583333336 | 4.34 |
| 44644.625 | 2.41 |
| 44644.635416666664 | 107.99 |
| 44644.645833333336 | 2.32 |
| 44644.65625 | 1.97 |
| 44644.666666666664 | 2.59 |
| 44644.677083333336 | 4.42 |
| 44644.6875 | 1.29 |
| 44644.697916666664 | 1.82 |
| 44644.708333333336 | 2.08 |
| 44644.71875 | 1.36 |
| 44644.729166666664 | 1.14 |
| 44644.739583333336 | 1.43 |
| 44644.75 | 1.29 |
| 44644.760416666664 | 3.07 |
| 44644.770833333336 | 2.68 |
| 44644.78125 | 1.51 |
| 44644.791666666664 | 1.53 |
| 44644.802083333336 | 3.93 |
| 44644.8125 | 1.07 |
| 44644.822916666664 | 12.05 |
| 44644.833333333336 | 3.38 |
| 44644.84375 | 3.82 |
| 44644.854166666664 | 4.4 |
| 44644.864583333336 | 6.6 |
| 44644.875 | 5.64 |
| 44644.885416666664 | 5.58 |
| 44644.895833333336 | 51.91 |
| 44644.90625 | 331.3 |
| 44644.916666666664 | 4.65 |
| 44644.927083333336 | 3.93 |
| 44644.9375 | 4.41 |
| 44644.947916666664 | 18.23 |
| 44644.958333333336 | 4.95 |
| 44644.96875 | 5.28 |
| 44644.979166666664 | 5.26 |
| 44644.989583333336 | 4.88 |
| 44645.0 | 4.96 |
| 44645.010416666664 | 4.66 |
| 44645.020833333336 | 7.06 |
| 44645.03125 | 6.09 |
| 44645.041666666664 | 5.57 |
| 44645.052083333336 | 5.07 |
| 44645.0625 | 5.14 |
| 44645.072916666664 | 5.19 |
| 44645.083333333336 | 4.26 |
| 44645.09375 | 3.18 |
| 44645.104166666664 | 2.91 |
| 44645.114583333336 | 2.52 |
| 44645.125 | 4.22 |
| 44645.135416666664 | 3.35 |
| 44645.145833333336 | 2.7 |
| 44645.15625 | 3.86 |
| 44645.166666666664 | 2.57 |
| 44645.177083333336 | 2.99 |
| 44645.1875 | 2.66 |
| 44645.197916666664 | 2.15 |
| 44645.208333333336 | 2 |
| 44645.21875 | 1.79 |
| 44645.229166666664 | 1.27 |
| 44645.239583333336 | 1.51 |
| 44645.25 | 1.9 |
| 44645.260416666664 | 1.4 |
| 44645.270833333336 | 2.43 |
| 44645.28125 | 1.13 |
| 44645.291666666664 | 1.24 |
| 44645.302083333336 | 3.1 |
| 44645.3125 | 1.23 |
| 44645.322916666664 | 4.09 |
| 44645.333333333336 | 1.13 |
| 44645.34375 | 2.81 |
| 44645.354166666664 | 3.32 |
| 44645.364583333336 | 6.25 |
| 44645.375 | 2.53 |
| 44645.385416666664 | 4.48 |
| 44645.395833333336 | 92.6 |
| 44645.40625 | 27.34 |
| 44645.416666666664 | 19.16 |
| 44645.427083333336 | 36.91 |
| 44645.4375 | 6.51 |
| 44645.447916666664 | 28.67 |
| 44645.458333333336 | 11.67 |
| 44645.46875 | 4.57 |
| 44645.479166666664 | 22.14 |
| 44645.489583333336 | 5.76 |
| 44645.5 | 5.26 |
| 44645.510416666664 | 6.16 |
| 44645.520833333336 | 5.62 |
| 44645.53125 | 5.39 |
| 44645.541666666664 | 5.53 |
| 44645.552083333336 | 6.02 |
| 44645.5625 | 6.01 |
| 44645.572916666664 | 5.69 |
| 44645.583333333336 | 7.71 |
| 44645.59375 | 4.65 |
| 44645.604166666664 | 5.12 |
| 44645.614583333336 | 23.1 |
| 44645.625 | 5.04 |
| 44645.635416666664 | 4.34 |
| 44645.645833333336 | 39.75 |
| 44645.65625 | 4.21 |
| 44645.666666666664 | 3.86 |
| 44645.677083333336 | 3.6 |
| 44645.6875 | 2.66 |
| 44645.697916666664 | 2.38 |
| 44645.708333333336 | 1.92 |
| 44645.71875 | 1.66 |
| 44645.729166666664 | 1.98 |
| 44645.739583333336 | 1.22 |
| 44645.75 | 1.23 |
| 44645.760416666664 | 1.06 |
| 44645.770833333336 | 1.11 |
| 44645.78125 | 0.8 |
| 44645.791666666664 | 1.03 |
| 44645.802083333336 | 0.91 |
| 44645.8125 | 0.95 |
| 44645.822916666664 | 1.04 |
| 44645.833333333336 | 1.02 |
| 44645.84375 | 1.66 |
| 44645.854166666664 | 1.22 |
| 44645.864583333336 | 1.45 |
| 44645.875 | 1.8 |
| 44645.885416666664 | 3.27 |
| 44645.895833333336 | 2.46 |
| 44645.90625 | 1.99 |
| 44645.916666666664 | 1.44 |
| 44645.927083333336 | 2.98 |
| 44645.9375 | 3.31 |
| 44645.947916666664 | 4.91 |
| 44645.958333333336 | 3.08 |
| 44645.96875 | 3.15 |
| 44645.979166666664 | 4.19 |
| 44645.989583333336 | 3.76 |
| 44646.0 | 3.74 |
| 44646.010416666664 | 4.33 |
| 44646.020833333336 | 435.7 |
| 44646.03125 | 14.25 |
| 44646.041666666664 | 5.08 |
| 44646.052083333336 | 4.7 |
| 44646.0625 | 4.69 |
| 44646.072916666664 | 4.62 |
| 44646.083333333336 | 4.42 |
| 44646.09375 | 4.19 |
| 44646.104166666664 | 4.01 |
| 44646.114583333336 | 3.67 |
| 44646.125 | 3.55 |
| 44646.135416666664 | 3.31 |
| 44646.145833333336 | 2.54 |
| 44646.15625 | 2.46 |
| 44646.166666666664 | 2.29 |
| 44646.177083333336 | 2.17 |
| 44646.1875 | 1.64 |
| 44646.197916666664 | 1.74 |
| 44646.208333333336 | 1.36 |
| 44646.21875 | 1.24 |
| 44646.229166666664 | 1.07 |
| 44646.239583333336 | 1.03 |
| 44646.25 | 0.9 |
| 44646.260416666664 | 0.98 |
| 44646.270833333336 | 0.93 |
| 44646.28125 | 0.95 |
| 44646.291666666664 | 0.84 |
| 44646.302083333336 | 0.82 |
| 44646.3125 | 0.94 |
| 44646.322916666664 | 0.8 |
| 44646.333333333336 | 0.87 |
| 44646.34375 | 0.94 |
| 44646.354166666664 | 0.94 |
| 44646.364583333336 | 0.8 |
| 44646.375 | 0.81 |
| 44646.385416666664 | 0.96 |
| 44646.395833333336 | 1.07 |
| 44646.40625 | 1.43 |
| 44646.416666666664 | 129.07 |
| 44646.427083333336 | 1.65 |
| 44646.4375 | 1.56 |
| 44646.447916666664 | 3.29 |
| 44646.458333333336 | 2.86 |
| 44646.46875 | 2.38 |
| 44646.479166666664 | 10.11 |
| 44646.489583333336 | 351.91 |
| 44646.5 | 2.42 |
| 44646.510416666664 | 19.07 |
| 44646.520833333336 | 4.63 |
| 44646.53125 | 4.98 |
| 44646.541666666664 | 5.18 |
| 44646.552083333336 | 2.92 |
| 44646.5625 | 5.26 |
| 44646.572916666664 | 4.25 |
| 44646.583333333336 | 4.23 |
| 44646.59375 | 3.65 |
| 44646.604166666664 | 3.78 |
| 44646.614583333336 | 3.59 |
| 44646.625 | 3.43 |
| 44646.635416666664 | 2.8 |
| 44646.645833333336 | 2.87 |
| 44646.65625 | 2.52 |
| 44646.666666666664 | 2.38 |
| 44646.677083333336 | 2.42 |
| 44646.6875 | 2.1 |
| 44646.697916666664 | 1.98 |
| 44646.708333333336 | 1.72 |
| 44646.71875 | 1.85 |
| 44646.729166666664 | 2.16 |
| 44646.739583333336 | 2.02 |
| 44646.75 | 1.8 |
| 44646.760416666664 | 1.76 |
| 44646.770833333336 | 1.55 |
| 44646.78125 | 1.92 |
| 44646.791666666664 | 1.65 |
| 44646.802083333336 | 1.6 |
| 44646.8125 | 1.55 |
| 44646.822916666664 | 1.54 |
| 44646.833333333336 | 1.41 |
| 44646.84375 | 1.45 |
| 44646.854166666664 | 1.49 |
| 44646.864583333336 | 1.52 |
| 44646.875 | 1.28 |
| 44646.885416666664 | 1.27 |
| 44646.895833333336 | 2.52 |
| 44646.90625 | 1.49 |
| 44646.916666666664 | 1.6 |
| 44646.927083333336 | 416.69 |
| 44646.9375 | 1.83 |
| 44646.947916666664 | 1.71 |
| 44646.958333333336 | 2.04 |
| 44646.96875 | 572.62 |
| 44646.979166666664 | 1.72 |
| 44646.989583333336 | 1.78 |
| 44647.0 | 2.42 |
| 44647.010416666664 | 2.49 |
| 44647.020833333336 | 2.82 |
| 44647.03125 | 3.28 |
| 44647.041666666664 | 2.59 |
| 44647.052083333336 | 3.67 |
| 44647.0625 | 3.12 |
| 44647.072916666664 | 4.94 |
| 44647.083333333336 | 3.27 |
| 44647.09375 | 3.53 |
| 44647.104166666664 | 3.65 |
| 44647.114583333336 | 3.79 |
| 44647.125 | 3.97 |
| 44647.135416666664 | 3.69 |
| 44647.145833333336 | 3.34 |
| 44647.15625 | 3.24 |
| 44647.166666666664 | 3.08 |
| 44647.177083333336 | 2.58 |
| 44647.1875 | 2.27 |
| 44647.197916666664 | 2.08 |
| 44647.208333333336 | 2.23 |
| 44647.21875 | 1.97 |
| 44647.229166666664 | 2.01 |
| 44647.239583333336 | 1.81 |
| 44647.25 | 1.52 |
| 44647.260416666664 | 1.64 |
| 44647.270833333336 | 1.48 |
| 44647.28125 | 1.4 |
| 44647.291666666664 | 1.24 |
| 44647.302083333336 | 1.28 |
| 44647.3125 | 1.19 |
| 44647.322916666664 | 1.18 |
| 44647.333333333336 | 1.16 |
| 44647.34375 | 1.23 |
| 44647.354166666664 | 1.14 |
| 44647.364583333336 | 1.27 |
| 44647.375 | 1.16 |
| 44647.385416666664 | 1.19 |
| 44647.395833333336 | 1.33 |
| 44647.40625 | 1.55 |
| 44647.416666666664 | 1.56 |
| 44647.427083333336 | 1.7 |
| 44647.4375 | 1.29 |
| 44647.447916666664 | 1.36 |
| 44647.458333333336 | 1.25 |
| 44647.46875 | 1.08 |
| 44647.479166666664 | 3.36 |
| 44647.489583333336 | 1.21 |
| 44647.5 | 1.69 |
| 44647.510416666664 | 2.61 |
| 44647.520833333336 | 1.73 |
| 44647.53125 | 1.68 |
| 44647.541666666664 | 1.99 |
| 44647.552083333336 | 2.53 |
| 44647.5625 | 9.69 |
| 44647.572916666664 | 418.02 |
| 44647.583333333336 | 2.73 |
| 44647.59375 | 3.1 |
| 44647.604166666664 | 3.11 |
| 44647.614583333336 | 2.67 |
| 44647.625 | 2.57 |
| 44647.635416666664 | 3.1 |
| 44647.645833333336 | 3.03 |
| 44647.65625 | 3.02 |
| 44647.666666666664 | 3.58 |
| 44647.677083333336 | 3.17 |
| 44647.6875 | 2.95 |
| 44647.697916666664 | 2.84 |
| 44647.708333333336 | 2.58 |
| 44647.71875 | 2.25 |
| 44647.729166666664 | 2.12 |
| 44647.739583333336 | 1.98 |
| 44647.75 | 2.13 |
| 44647.760416666664 | 1.83 |
| 44647.770833333336 | 1.66 |
| 44647.78125 | 1.46 |
| 44647.791666666664 | 1.41 |
| 44647.802083333336 | 1.08 |
| 44647.8125 | 1.08 |
| 44647.822916666664 | 0.93 |
| 44647.833333333336 | 0.92 |
| 44647.84375 | 0.74 |
| 44647.854166666664 | 0.7 |
| 44647.864583333336 | 0.72 |
| 44647.875 | 0.75 |
| 44647.885416666664 | 0.71 |
| 44647.895833333336 | 0.89 |
| 44647.90625 | 0.91 |
| 44647.916666666664 | 0.87 |
| 44647.927083333336 | 0.95 |
| 44647.9375 | 1.02 |
| 44647.947916666664 | 1.07 |
| 44647.958333333336 | 0.94 |
| 44647.96875 | 2.9 |
| 44647.979166666664 | 1.13 |
| 44647.989583333336 | 1.56 |
| 44648.0 | 1.25 |
| 44648.010416666664 | 1.07 |
| 44648.020833333336 | 1.18 |
| 44648.03125 | 3.07 |
| 44648.041666666664 | 1.53 |
| 44648.052083333336 | 3.53 |
| 44648.0625 | 2.1 |
| 44648.072916666664 | 1.63 |
| 44648.083333333336 | 2.88 |
| 44648.09375 | 2.52 |
| 44648.104166666664 | 2.91 |
| 44648.114583333336 | 2.73 |
| 44648.125 | 2.84 |
| 44648.135416666664 | 3.05 |
| 44648.145833333336 | 3.47 |
| 44648.15625 | 3.34 |
| 44648.166666666664 | 3.57 |
| 44648.177083333336 | 3.34 |
| 44648.1875 | 3.15 |
| 44648.197916666664 | 3.02 |
| 44648.208333333336 | 3.11 |
| 44648.21875 | 2.8 |
| 44648.229166666664 | 2.52 |
| 44648.239583333336 | 2.58 |
| 44648.25 | 2.61 |
| 44648.260416666664 | 2.34 |
| 44648.270833333336 | 2.49 |
| 44648.28125 | 2.6 |
| 44648.291666666664 | 2.16 |
| 44648.302083333336 | 2.37 |
| 44648.3125 | 2.25 |
| 44648.322916666664 | 2.34 |
| 44648.333333333336 | 2.2 |
| 44648.34375 | 2.12 |
| 44648.354166666664 | 1.83 |
| 44648.364583333336 | 1.84 |
| 44648.375 | 1.81 |
| 44648.385416666664 | 1.64 |
| 44648.395833333336 | 1.89 |
| 44648.40625 | 1.58 |
| 44648.416666666664 | 1.68 |
| 44648.427083333336 | 1.55 |
| 44648.4375 | 1.64 |
| 44648.447916666664 | 1.61 |
| 44648.458333333336 | 2.03 |
| 44648.46875 | 2.69 |
| 44648.479166666664 | 1.6 |
| 44648.489583333336 | 1.44 |
| 44648.5 | 1.25 |
| 44648.510416666664 | 1.24 |
| 44648.520833333336 | 4.99 |
| 44648.53125 | 1.29 |
| 44648.541666666664 | 1.04 |
| 44648.552083333336 | 0.99 |
| 44648.5625 | 0.75 |
| 44648.572916666664 | 0.93 |
| 44648.583333333336 | 1.23 |
| 44648.59375 | 3.47 |
| 44648.604166666664 | 3.49 |
| 44648.614583333336 | 1.65 |
| 44648.625 | 2.03 |
| 44648.635416666664 | 1.9 |
| 44648.645833333336 | 1.91 |
| 44648.65625 | 1.67 |
| 44648.666666666664 | 1.7 |
| 44648.677083333336 | 1.81 |
| 44648.6875 | 2.02 |
| 44648.697916666664 | 2.5 |
| 44648.708333333336 | 1.8 |
| 44648.71875 | 1.57 |
| 44648.729166666664 | 1.62 |
| 44648.739583333336 | 2.02 |
| 44648.75 | 1.59 |
| 44648.760416666664 | 1.46 |
| 44648.770833333336 | 1.41 |
| 44648.78125 | 1.15 |
| 44648.791666666664 | 1.33 |
| 44648.802083333336 | 1.23 |
| 44648.8125 | 1.43 |
| 44648.822916666664 | 1.35 |
| 44648.833333333336 | 1.06 |
| 44648.84375 | 1.01 |
| 44648.854166666664 | 0.95 |
| 44648.864583333336 | 0.88 |
| 44648.875 | 0.94 |
| 44648.885416666664 | 0.83 |
| 44648.895833333336 | 0.85 |
| 44648.90625 | 0.87 |
| 44648.916666666664 | 0.84 |
| 44648.927083333336 | 0.88 |
| 44648.9375 | 0.98 |
| 44648.947916666664 | 0.86 |
| 44648.958333333336 | 1.03 |
| 44648.96875 | 1.06 |
| 44648.979166666664 | 1.17 |
| 44648.989583333336 | 1 |
| 44649.0 | 1.29 |
| 44649.010416666664 | 1.35 |
| 44649.020833333336 | 4.5 |
| 44649.03125 | 1.61 |
| 44649.041666666664 | 1.7 |
| 44649.052083333336 | 2.49 |
| 44649.0625 | 2.95 |
| 44649.072916666664 | 3.04 |
| 44649.083333333336 | 3.31 |
| 44649.09375 | 3.24 |
| 44649.104166666664 | 3.31 |
| 44649.114583333336 | 3.89 |
| 44649.125 | 3.63 |
| 44649.135416666664 | 3.77 |
| 44649.145833333336 | 3.63 |
| 44649.15625 | 4.1 |
| 44649.166666666664 | 3.48 |
| 44649.177083333336 | 3.37 |
| 44649.1875 | 3.26 |
| 44649.197916666664 | 3.1 |
| 44649.208333333336 | 2.91 |
| 44649.21875 | 2.87 |
| 44649.229166666664 | 2.83 |
| 44649.239583333336 | 3.02 |
| 44649.25 | 2.74 |
| 44649.260416666664 | 2.73 |
| 44649.270833333336 | 2.79 |
| 44649.28125 | 2.92 |
| 44649.291666666664 | 2.79 |
| 44649.302083333336 | 2.72 |
| 44649.3125 | 2.64 |
| 44649.322916666664 | 2.55 |
| 44649.333333333336 | 4.11 |
| 44649.34375 | 2.24 |
| 44649.354166666664 | 2.06 |
| 44649.364583333336 | 1.8 |
| 44649.375 | 1.56 |
| 44649.385416666664 | 1.44 |
| 44649.395833333336 | 2.15 |
| 44649.40625 | 1.5 |
| 44649.416666666664 | 1.52 |
| 44649.427083333336 | 1.58 |
| 44649.4375 | 1.59 |
| 44649.447916666664 | 1.6 |
| 44649.458333333336 | 1.7 |
| 44649.46875 | 1.76 |
| 44649.479166666664 | 1.46 |
| 44649.489583333336 | 1.69 |
| 44649.5 | 1.66 |
| 44649.510416666664 | 1.29 |
| 44649.520833333336 | 1.07 |
| 44649.53125 | 0.9 |
| 44649.541666666664 | 0.81 |
| 44649.552083333336 | 1.19 |
| 44649.5625 | 1.15 |
| 44649.572916666664 | 2.33 |
| 44649.583333333336 | 1 |
| 44649.59375 | 2.51 |
| 44649.604166666664 | 2.31 |
| 44649.614583333336 | 0.94 |
| 44649.625 | 1.36 |
| 44649.635416666664 | 1.62 |
| 44649.645833333336 | 2.79 |
| 44649.65625 | 4.28 |
| 44649.666666666664 | 6.52 |
| 44649.677083333336 | 3.3 |
| 44649.6875 | 1.81 |
| 44649.697916666664 | 1.24 |
| 44649.708333333336 | 2.06 |
| 44649.71875 | 2.65 |
| 44649.729166666664 | 2 |
| 44649.739583333336 | 2.25 |
| 44649.75 | 1.45 |
| 44649.760416666664 | 1.54 |
| 44649.770833333336 | 1.62 |
| 44649.78125 | 1.62 |
| 44649.791666666664 | 1.52 |
| 44649.802083333336 | 1.52 |
| 44649.8125 | 1.54 |
| 44649.822916666664 | 1.65 |
| 44649.833333333336 | 1.77 |
| 44649.84375 | 1.44 |
| 44649.854166666664 | 1.41 |
| 44649.864583333336 | 1.43 |
| 44649.875 | 1.18 |
| 44649.885416666664 | 1.33 |
| 44649.895833333336 | 1.14 |
| 44649.90625 | 2.44 |
| 44649.916666666664 | 1.39 |
| 44649.927083333336 | 1.35 |
| 44649.9375 | 1.24 |
| 44649.947916666664 | 1.55 |
| 44649.958333333336 | 1.35 |
| 44649.96875 | 1.38 |
| 44649.979166666664 | 1.36 |
| 44649.989583333336 | 1.43 |
| 44650.0 | 1.66 |
| 44650.010416666664 | 1.84 |
| 44650.020833333336 | 1.71 |
| 44650.03125 | 1.59 |
| 44650.041666666664 | 3.71 |
| 44650.052083333336 | 1.44 |
| 44650.0625 | 1.59 |
| 44650.072916666664 | 1.34 |
| 44650.083333333336 | 3.11 |
| 44650.09375 | 1.88 |
| 44650.104166666664 | 1.38 |
| 44650.114583333336 | 2.78 |
| 44650.125 | 1.66 |
| 44650.135416666664 | 1.96 |
| 44650.145833333336 | 2.07 |
| 44650.15625 | 5.57 |
| 44650.166666666664 | 1.68 |
| 44650.177083333336 | 2.55 |
| 44650.1875 | 1.94 |
| 44650.197916666664 | 4.58 |
| 44650.208333333336 | 3.07 |
| 44650.21875 | 2.65 |
| 44650.229166666664 | 2.81 |
| 44650.239583333336 | 2.74 |
| 44650.25 | 2.64 |
| 44650.260416666664 | 2.65 |
| 44650.270833333336 | 2.03 |
| 44650.28125 | 3.77 |
| 44650.291666666664 | 133.65 |
| 44650.302083333336 | 2.4 |
| 44650.3125 | 2.17 |
| 44650.322916666664 | 2.29 |
| 44650.333333333336 | 2.34 |
| 44650.34375 | 2.02 |
| 44650.354166666664 | 1.87 |
| 44650.364583333336 | 1.59 |
| 44650.375 | 1.31 |
| 44650.385416666664 | 1.96 |
| 44650.395833333336 | 3.59 |
| 44650.40625 | 1.74 |
| 44650.416666666664 | 0.72 |
| 44650.427083333336 | 1.34 |
| 44650.4375 | 1.19 |
| 44650.447916666664 | 3.29 |
| 44650.458333333336 | 1.2 |
| 44650.46875 | 4.27 |
| 44650.479166666664 | 1.27 |
| 44650.489583333336 | 1.36 |
| 44650.5 | 1.43 |
| 44650.510416666664 | 1.1 |
| 44650.520833333336 | 1.1 |
| 44650.53125 | 1.59 |
| 44650.541666666664 | 2.96 |
| 44650.552083333336 | 1.67 |
| 44650.5625 | 0.95 |
| 44650.572916666664 | 0.96 |
| 44650.583333333336 | 1.06 |
| 44650.59375 | 1.24 |
| 44650.604166666664 | 0.94 |
| 44650.614583333336 | 1.14 |
| 44650.625 | 0.82 |
| 44650.635416666664 | 1.12 |
| 44650.645833333336 | 0.96 |
| 44650.65625 | 13.75 |
| 44650.666666666664 | 1.8 |
| 44650.677083333336 | 1.69 |
| 44650.6875 | 1.39 |
| 44650.697916666664 | 1.48 |
| 44650.708333333336 | 2.01 |
| 44650.71875 | 3.11 |
| 44650.729166666664 | 2.39 |
| 44650.739583333336 | 1.7 |
| 44650.75 | 1.74 |
| 44650.760416666664 | 2.2 |
| 44650.770833333336 | 2.34 |
| 44650.78125 | 2.16 |
| 44650.791666666664 | 2.29 |
| 44650.802083333336 | 2.08 |
| 44650.8125 | 2.29 |
| 44650.822916666664 | 2.14 |
| 44650.833333333336 | 1.89 |
| 44650.84375 | 1.65 |
| 44650.854166666664 | 1.49 |
| 44650.864583333336 | 1.53 |
| 44650.875 | 1.3 |
| 44650.885416666664 | 1.24 |
| 44650.895833333336 | 1.47 |
| 44650.90625 | 1.34 |
| 44650.916666666664 | 1.34 |
| 44650.927083333336 | 1.35 |
| 44650.9375 | 1.33 |
| 44650.947916666664 | 1.2 |
| 44650.958333333336 | 1.22 |
| 44650.96875 | 1.23 |
| 44650.979166666664 | 1.34 |
| 44650.989583333336 | 1.39 |
| 44651.0 | 1.43 |
| 44651.010416666664 | 1.33 |
| 44651.020833333336 | 1.26 |
| 44651.03125 | 1.33 |
| 44651.041666666664 | 1.3 |
| 44651.052083333336 | 1.35 |
| 44651.0625 | 1.39 |
| 44651.072916666664 | 1.35 |
| 44651.083333333336 | 1.31 |
| 44651.09375 | 1.22 |
| 44651.104166666664 | 1.29 |
| 44651.114583333336 | 1.21 |
| 44651.125 | 1.35 |
| 44651.135416666664 | 1.37 |
| 44651.145833333336 | 1.26 |
| 44651.15625 | 1.52 |
| 44651.166666666664 | 1.62 |
| 44651.177083333336 | 2.08 |
| 44651.1875 | 2 |
| 44651.197916666664 | 2.12 |
| 44651.208333333336 | 2.24 |
| 44651.21875 | 2.39 |
| 44651.229166666664 | 2.46 |
| 44651.239583333336 | 2.44 |
| 44651.25 | 2.54 |
| 44651.260416666664 | 2.38 |
| 44651.270833333336 | 2.65 |
| 44651.28125 | 2.62 |
| 44651.291666666664 | 2.71 |
| 44651.302083333336 | 2.67 |
| 44651.3125 | 2.42 |
| 44651.322916666664 | 2.43 |
| 44651.333333333336 | 2.26 |
| 44651.34375 | 2.45 |
| 44651.354166666664 | 2.31 |
| 44651.364583333336 | 2.25 |
| 44651.375 | 2 |
| 44651.385416666664 | 1.93 |
| 44651.395833333336 | 1.87 |
| 44651.40625 | 2.11 |
| 44651.416666666664 | 1.8 |
| 44651.427083333336 | 1.77 |
| 44651.4375 | 1.9 |
| 44651.447916666664 | 1.72 |
| 44651.458333333336 | 1.54 |
| 44651.46875 | 1.72 |
| 44651.479166666664 | 1.67 |
| 44651.489583333336 | 1.54 |
| 44651.5 | 1.53 |
| 44651.510416666664 | 1.37 |
| 44651.520833333336 | 1.32 |
| 44651.53125 | 1.39 |
| 44651.541666666664 | 1.29 |
| 44651.552083333336 | 1.19 |
| 44651.5625 | 1.33 |
| 44651.572916666664 | 1.33 |
| 44651.583333333336 | 1.44 |
| 44651.59375 | 1.03 |
| 44651.604166666664 | 1.17 |
| 44651.614583333336 | 1.17 |
| 44651.625 | 1.07 |
| 44651.635416666664 | 1.22 |
| 44651.645833333336 | 1.09 |
| 44651.65625 | 1.06 |
| 44651.666666666664 | 1.35 |
| 44651.677083333336 | 1.24 |
| 44651.6875 | 1.62 |
| 44651.697916666664 | 2.16 |
| 44651.708333333336 | 2.19 |
| 44651.71875 | 2.35 |
| 44651.729166666664 | 1.92 |
| 44651.739583333336 | 1.93 |
| 44651.75 | 2.27 |
| 44651.760416666664 | 2.41 |
| 44651.770833333336 | 2.49 |
| 44651.78125 | 2.49 |
| 44651.791666666664 | 2.7 |
| 44651.802083333336 | 2.62 |
| 44651.8125 | 3.08 |
| 44651.822916666664 | 2.64 |
| 44651.833333333336 | 2.46 |
| 44651.84375 | 2.25 |
| 44651.854166666664 | 2.45 |
| 44651.864583333336 | 2.78 |
| 44651.875 | 2.73 |
| 44651.885416666664 | 3.07 |
| 44651.895833333336 | 2.87 |
| 44651.90625 | 3.16 |
| 44651.916666666664 | 3.06 |
| 44651.927083333336 | 3.13 |
| 44651.9375 | 2.89 |
| 44651.947916666664 | 2.98 |
| 44651.958333333336 | 3.14 |
| 44651.96875 | 3.15 |
| 44651.979166666664 | 3.03 |
| 44651.989583333336 | 3.01 |
| 44652.0 | 3.14 |
| 44652.010416666664 | 3.26 |
| 44652.020833333336 | 2.75 |
| 44652.03125 | 2.67 |
| 44652.041666666664 | 2.49 |
| 44652.052083333336 | 2.44 |
| 44652.0625 | 2.46 |
| 44652.072916666664 | 2.54 |
| 44652.083333333336 | 2.28 |
| 44652.09375 | 2.44 |
| 44652.104166666664 | 2.08 |
| 44652.114583333336 | 2.04 |
| 44652.125 | 2.03 |
| 44652.135416666664 | 1.85 |
| 44652.145833333336 | 2.11 |